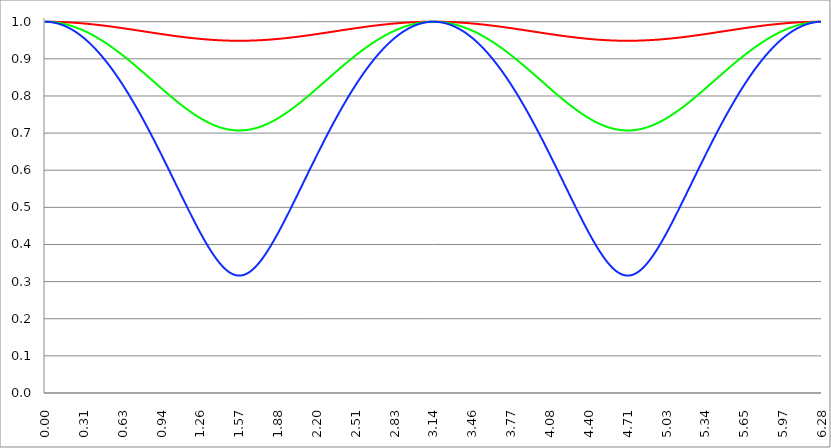
| Category | Series 1 | Series 0 | Series 2 |
|---|---|---|---|
| 0.0 | 1 | 1 | 1 |
| 0.00314159265358979 | 1 | 1 | 1 |
| 0.00628318530717958 | 1 | 1 | 1 |
| 0.00942477796076938 | 1 | 1 | 1 |
| 0.0125663706143592 | 1 | 1 | 1 |
| 0.015707963267949 | 1 | 1 | 1 |
| 0.0188495559215388 | 1 | 1 | 1 |
| 0.0219911485751285 | 1 | 1 | 1 |
| 0.0251327412287183 | 1 | 1 | 1 |
| 0.0282743338823081 | 1 | 1 | 1 |
| 0.0314159265358979 | 1 | 1 | 1 |
| 0.0345575191894877 | 1 | 1 | 0.999 |
| 0.0376991118430775 | 1 | 1 | 0.999 |
| 0.0408407044966673 | 1 | 1 | 0.999 |
| 0.0439822971502571 | 1 | 1 | 0.999 |
| 0.0471238898038469 | 1 | 0.999 | 0.999 |
| 0.0502654824574367 | 1 | 0.999 | 0.999 |
| 0.0534070751110265 | 1 | 0.999 | 0.999 |
| 0.0565486677646163 | 1 | 0.999 | 0.999 |
| 0.059690260418206 | 1 | 0.999 | 0.998 |
| 0.0628318530717958 | 1 | 0.999 | 0.998 |
| 0.0659734457253856 | 1 | 0.999 | 0.998 |
| 0.0691150383789754 | 1 | 0.999 | 0.998 |
| 0.0722566310325652 | 1 | 0.999 | 0.998 |
| 0.075398223686155 | 1 | 0.999 | 0.997 |
| 0.0785398163397448 | 1 | 0.998 | 0.997 |
| 0.0816814089933346 | 1 | 0.998 | 0.997 |
| 0.0848230016469244 | 1 | 0.998 | 0.997 |
| 0.0879645943005142 | 1 | 0.998 | 0.997 |
| 0.091106186954104 | 1 | 0.998 | 0.996 |
| 0.0942477796076937 | 1 | 0.998 | 0.996 |
| 0.0973893722612835 | 1 | 0.998 | 0.996 |
| 0.100530964914873 | 0.999 | 0.997 | 0.995 |
| 0.103672557568463 | 0.999 | 0.997 | 0.995 |
| 0.106814150222053 | 0.999 | 0.997 | 0.995 |
| 0.109955742875643 | 0.999 | 0.997 | 0.995 |
| 0.113097335529233 | 0.999 | 0.997 | 0.994 |
| 0.116238928182822 | 0.999 | 0.997 | 0.994 |
| 0.119380520836412 | 0.999 | 0.996 | 0.994 |
| 0.122522113490002 | 0.999 | 0.996 | 0.993 |
| 0.125663706143592 | 0.999 | 0.996 | 0.993 |
| 0.128805298797181 | 0.999 | 0.996 | 0.993 |
| 0.131946891450771 | 0.999 | 0.996 | 0.992 |
| 0.135088484104361 | 0.999 | 0.995 | 0.992 |
| 0.138230076757951 | 0.999 | 0.995 | 0.991 |
| 0.141371669411541 | 0.999 | 0.995 | 0.991 |
| 0.14451326206513 | 0.999 | 0.995 | 0.991 |
| 0.14765485471872 | 0.999 | 0.995 | 0.99 |
| 0.15079644737231 | 0.999 | 0.994 | 0.99 |
| 0.1539380400259 | 0.999 | 0.994 | 0.989 |
| 0.15707963267949 | 0.999 | 0.994 | 0.989 |
| 0.160221225333079 | 0.999 | 0.994 | 0.988 |
| 0.163362817986669 | 0.999 | 0.993 | 0.988 |
| 0.166504410640259 | 0.999 | 0.993 | 0.988 |
| 0.169646003293849 | 0.999 | 0.993 | 0.987 |
| 0.172787595947439 | 0.999 | 0.993 | 0.987 |
| 0.175929188601028 | 0.998 | 0.992 | 0.986 |
| 0.179070781254618 | 0.998 | 0.992 | 0.986 |
| 0.182212373908208 | 0.998 | 0.992 | 0.985 |
| 0.185353966561798 | 0.998 | 0.991 | 0.985 |
| 0.188495559215388 | 0.998 | 0.991 | 0.984 |
| 0.191637151868977 | 0.998 | 0.991 | 0.984 |
| 0.194778744522567 | 0.998 | 0.991 | 0.983 |
| 0.197920337176157 | 0.998 | 0.99 | 0.982 |
| 0.201061929829747 | 0.998 | 0.99 | 0.982 |
| 0.204203522483336 | 0.998 | 0.99 | 0.981 |
| 0.207345115136926 | 0.998 | 0.989 | 0.981 |
| 0.210486707790516 | 0.998 | 0.989 | 0.98 |
| 0.213628300444106 | 0.998 | 0.989 | 0.98 |
| 0.216769893097696 | 0.998 | 0.988 | 0.979 |
| 0.219911485751285 | 0.998 | 0.988 | 0.978 |
| 0.223053078404875 | 0.998 | 0.988 | 0.978 |
| 0.226194671058465 | 0.997 | 0.987 | 0.977 |
| 0.229336263712055 | 0.997 | 0.987 | 0.976 |
| 0.232477856365645 | 0.997 | 0.987 | 0.976 |
| 0.235619449019234 | 0.997 | 0.986 | 0.975 |
| 0.238761041672824 | 0.997 | 0.986 | 0.975 |
| 0.241902634326414 | 0.997 | 0.986 | 0.974 |
| 0.245044226980004 | 0.997 | 0.985 | 0.973 |
| 0.248185819633594 | 0.997 | 0.985 | 0.972 |
| 0.251327412287183 | 0.997 | 0.984 | 0.972 |
| 0.254469004940773 | 0.997 | 0.984 | 0.971 |
| 0.257610597594363 | 0.997 | 0.984 | 0.97 |
| 0.260752190247953 | 0.997 | 0.983 | 0.97 |
| 0.263893782901543 | 0.997 | 0.983 | 0.969 |
| 0.267035375555132 | 0.997 | 0.982 | 0.968 |
| 0.270176968208722 | 0.996 | 0.982 | 0.967 |
| 0.273318560862312 | 0.996 | 0.982 | 0.967 |
| 0.276460153515902 | 0.996 | 0.981 | 0.966 |
| 0.279601746169492 | 0.996 | 0.981 | 0.965 |
| 0.282743338823082 | 0.996 | 0.98 | 0.964 |
| 0.285884931476671 | 0.996 | 0.98 | 0.964 |
| 0.289026524130261 | 0.996 | 0.979 | 0.963 |
| 0.292168116783851 | 0.996 | 0.979 | 0.962 |
| 0.295309709437441 | 0.996 | 0.979 | 0.961 |
| 0.298451302091031 | 0.996 | 0.978 | 0.96 |
| 0.30159289474462 | 0.996 | 0.978 | 0.959 |
| 0.30473448739821 | 0.995 | 0.977 | 0.959 |
| 0.3078760800518 | 0.995 | 0.977 | 0.958 |
| 0.31101767270539 | 0.995 | 0.976 | 0.957 |
| 0.31415926535898 | 0.995 | 0.976 | 0.956 |
| 0.31730085801257 | 0.995 | 0.975 | 0.955 |
| 0.320442450666159 | 0.995 | 0.975 | 0.954 |
| 0.323584043319749 | 0.995 | 0.974 | 0.953 |
| 0.326725635973339 | 0.995 | 0.974 | 0.953 |
| 0.329867228626929 | 0.995 | 0.973 | 0.952 |
| 0.333008821280519 | 0.995 | 0.973 | 0.951 |
| 0.336150413934108 | 0.995 | 0.972 | 0.95 |
| 0.339292006587698 | 0.994 | 0.972 | 0.949 |
| 0.342433599241288 | 0.994 | 0.971 | 0.948 |
| 0.345575191894878 | 0.994 | 0.971 | 0.947 |
| 0.348716784548468 | 0.994 | 0.97 | 0.946 |
| 0.351858377202058 | 0.994 | 0.97 | 0.945 |
| 0.354999969855647 | 0.994 | 0.969 | 0.944 |
| 0.358141562509237 | 0.994 | 0.969 | 0.943 |
| 0.361283155162827 | 0.994 | 0.968 | 0.942 |
| 0.364424747816417 | 0.994 | 0.968 | 0.941 |
| 0.367566340470007 | 0.994 | 0.967 | 0.94 |
| 0.370707933123597 | 0.993 | 0.967 | 0.939 |
| 0.373849525777186 | 0.993 | 0.966 | 0.938 |
| 0.376991118430776 | 0.993 | 0.966 | 0.937 |
| 0.380132711084366 | 0.993 | 0.965 | 0.936 |
| 0.383274303737956 | 0.993 | 0.964 | 0.935 |
| 0.386415896391546 | 0.993 | 0.964 | 0.934 |
| 0.389557489045135 | 0.993 | 0.963 | 0.933 |
| 0.392699081698725 | 0.993 | 0.963 | 0.932 |
| 0.395840674352315 | 0.993 | 0.962 | 0.931 |
| 0.398982267005905 | 0.992 | 0.962 | 0.93 |
| 0.402123859659495 | 0.992 | 0.961 | 0.929 |
| 0.405265452313085 | 0.992 | 0.96 | 0.927 |
| 0.408407044966674 | 0.992 | 0.96 | 0.926 |
| 0.411548637620264 | 0.992 | 0.959 | 0.925 |
| 0.414690230273854 | 0.992 | 0.959 | 0.924 |
| 0.417831822927444 | 0.992 | 0.958 | 0.923 |
| 0.420973415581034 | 0.992 | 0.957 | 0.922 |
| 0.424115008234623 | 0.991 | 0.957 | 0.921 |
| 0.427256600888213 | 0.991 | 0.956 | 0.919 |
| 0.430398193541803 | 0.991 | 0.955 | 0.918 |
| 0.433539786195393 | 0.991 | 0.955 | 0.917 |
| 0.436681378848983 | 0.991 | 0.954 | 0.916 |
| 0.439822971502573 | 0.991 | 0.954 | 0.915 |
| 0.442964564156162 | 0.991 | 0.953 | 0.914 |
| 0.446106156809752 | 0.991 | 0.952 | 0.912 |
| 0.449247749463342 | 0.991 | 0.952 | 0.911 |
| 0.452389342116932 | 0.99 | 0.951 | 0.91 |
| 0.455530934770522 | 0.99 | 0.95 | 0.909 |
| 0.458672527424111 | 0.99 | 0.95 | 0.908 |
| 0.461814120077701 | 0.99 | 0.949 | 0.906 |
| 0.464955712731291 | 0.99 | 0.948 | 0.905 |
| 0.468097305384881 | 0.99 | 0.948 | 0.904 |
| 0.471238898038471 | 0.99 | 0.947 | 0.902 |
| 0.474380490692061 | 0.99 | 0.946 | 0.901 |
| 0.47752208334565 | 0.989 | 0.946 | 0.9 |
| 0.48066367599924 | 0.989 | 0.945 | 0.899 |
| 0.48380526865283 | 0.989 | 0.944 | 0.897 |
| 0.48694686130642 | 0.989 | 0.944 | 0.896 |
| 0.49008845396001 | 0.989 | 0.943 | 0.895 |
| 0.493230046613599 | 0.989 | 0.942 | 0.893 |
| 0.496371639267189 | 0.989 | 0.942 | 0.892 |
| 0.499513231920779 | 0.988 | 0.941 | 0.891 |
| 0.502654824574369 | 0.988 | 0.94 | 0.889 |
| 0.505796417227959 | 0.988 | 0.939 | 0.888 |
| 0.508938009881549 | 0.988 | 0.939 | 0.887 |
| 0.512079602535138 | 0.988 | 0.938 | 0.885 |
| 0.515221195188728 | 0.988 | 0.937 | 0.884 |
| 0.518362787842318 | 0.988 | 0.937 | 0.883 |
| 0.521504380495908 | 0.988 | 0.936 | 0.881 |
| 0.524645973149498 | 0.987 | 0.935 | 0.88 |
| 0.527787565803087 | 0.987 | 0.934 | 0.878 |
| 0.530929158456677 | 0.987 | 0.934 | 0.877 |
| 0.534070751110267 | 0.987 | 0.933 | 0.876 |
| 0.537212343763857 | 0.987 | 0.932 | 0.874 |
| 0.540353936417447 | 0.987 | 0.931 | 0.873 |
| 0.543495529071037 | 0.987 | 0.931 | 0.871 |
| 0.546637121724626 | 0.986 | 0.93 | 0.87 |
| 0.549778714378216 | 0.986 | 0.929 | 0.869 |
| 0.552920307031806 | 0.986 | 0.928 | 0.867 |
| 0.556061899685396 | 0.986 | 0.928 | 0.866 |
| 0.559203492338986 | 0.986 | 0.927 | 0.864 |
| 0.562345084992576 | 0.986 | 0.926 | 0.863 |
| 0.565486677646165 | 0.986 | 0.925 | 0.861 |
| 0.568628270299755 | 0.985 | 0.925 | 0.86 |
| 0.571769862953345 | 0.985 | 0.924 | 0.858 |
| 0.574911455606935 | 0.985 | 0.923 | 0.857 |
| 0.578053048260525 | 0.985 | 0.922 | 0.855 |
| 0.581194640914114 | 0.985 | 0.922 | 0.854 |
| 0.584336233567704 | 0.985 | 0.921 | 0.852 |
| 0.587477826221294 | 0.985 | 0.92 | 0.851 |
| 0.590619418874884 | 0.984 | 0.919 | 0.849 |
| 0.593761011528474 | 0.984 | 0.918 | 0.848 |
| 0.596902604182064 | 0.984 | 0.918 | 0.846 |
| 0.600044196835653 | 0.984 | 0.917 | 0.844 |
| 0.603185789489243 | 0.984 | 0.916 | 0.843 |
| 0.606327382142833 | 0.984 | 0.915 | 0.841 |
| 0.609468974796423 | 0.983 | 0.914 | 0.84 |
| 0.612610567450013 | 0.983 | 0.914 | 0.838 |
| 0.615752160103602 | 0.983 | 0.913 | 0.837 |
| 0.618893752757192 | 0.983 | 0.912 | 0.835 |
| 0.622035345410782 | 0.983 | 0.911 | 0.833 |
| 0.625176938064372 | 0.983 | 0.91 | 0.832 |
| 0.628318530717962 | 0.983 | 0.91 | 0.83 |
| 0.631460123371551 | 0.982 | 0.909 | 0.828 |
| 0.634601716025141 | 0.982 | 0.908 | 0.827 |
| 0.637743308678731 | 0.982 | 0.907 | 0.825 |
| 0.640884901332321 | 0.982 | 0.906 | 0.824 |
| 0.644026493985911 | 0.982 | 0.905 | 0.822 |
| 0.647168086639501 | 0.982 | 0.905 | 0.82 |
| 0.65030967929309 | 0.982 | 0.904 | 0.819 |
| 0.65345127194668 | 0.981 | 0.903 | 0.817 |
| 0.65659286460027 | 0.981 | 0.902 | 0.815 |
| 0.65973445725386 | 0.981 | 0.901 | 0.814 |
| 0.66287604990745 | 0.981 | 0.9 | 0.812 |
| 0.666017642561039 | 0.981 | 0.9 | 0.81 |
| 0.669159235214629 | 0.981 | 0.899 | 0.809 |
| 0.672300827868219 | 0.98 | 0.898 | 0.807 |
| 0.675442420521809 | 0.98 | 0.897 | 0.805 |
| 0.678584013175399 | 0.98 | 0.896 | 0.803 |
| 0.681725605828989 | 0.98 | 0.895 | 0.802 |
| 0.684867198482578 | 0.98 | 0.894 | 0.8 |
| 0.688008791136168 | 0.98 | 0.894 | 0.798 |
| 0.691150383789758 | 0.979 | 0.893 | 0.796 |
| 0.694291976443348 | 0.979 | 0.892 | 0.795 |
| 0.697433569096938 | 0.979 | 0.891 | 0.793 |
| 0.700575161750528 | 0.979 | 0.89 | 0.791 |
| 0.703716754404117 | 0.979 | 0.889 | 0.789 |
| 0.706858347057707 | 0.979 | 0.888 | 0.788 |
| 0.709999939711297 | 0.979 | 0.887 | 0.786 |
| 0.713141532364887 | 0.978 | 0.887 | 0.784 |
| 0.716283125018477 | 0.978 | 0.886 | 0.782 |
| 0.719424717672066 | 0.978 | 0.885 | 0.781 |
| 0.722566310325656 | 0.978 | 0.884 | 0.779 |
| 0.725707902979246 | 0.978 | 0.883 | 0.777 |
| 0.728849495632836 | 0.978 | 0.882 | 0.775 |
| 0.731991088286426 | 0.977 | 0.881 | 0.773 |
| 0.735132680940016 | 0.977 | 0.88 | 0.771 |
| 0.738274273593605 | 0.977 | 0.88 | 0.77 |
| 0.741415866247195 | 0.977 | 0.879 | 0.768 |
| 0.744557458900785 | 0.977 | 0.878 | 0.766 |
| 0.747699051554375 | 0.977 | 0.877 | 0.764 |
| 0.750840644207965 | 0.976 | 0.876 | 0.762 |
| 0.753982236861554 | 0.976 | 0.875 | 0.76 |
| 0.757123829515144 | 0.976 | 0.874 | 0.759 |
| 0.760265422168734 | 0.976 | 0.873 | 0.757 |
| 0.763407014822324 | 0.976 | 0.872 | 0.755 |
| 0.766548607475914 | 0.976 | 0.871 | 0.753 |
| 0.769690200129504 | 0.975 | 0.871 | 0.751 |
| 0.772831792783093 | 0.975 | 0.87 | 0.749 |
| 0.775973385436683 | 0.975 | 0.869 | 0.747 |
| 0.779114978090273 | 0.975 | 0.868 | 0.745 |
| 0.782256570743863 | 0.975 | 0.867 | 0.744 |
| 0.785398163397453 | 0.975 | 0.866 | 0.742 |
| 0.788539756051042 | 0.975 | 0.865 | 0.74 |
| 0.791681348704632 | 0.974 | 0.864 | 0.738 |
| 0.794822941358222 | 0.974 | 0.863 | 0.736 |
| 0.797964534011812 | 0.974 | 0.862 | 0.734 |
| 0.801106126665402 | 0.974 | 0.861 | 0.732 |
| 0.804247719318992 | 0.974 | 0.861 | 0.73 |
| 0.807389311972581 | 0.974 | 0.86 | 0.728 |
| 0.810530904626171 | 0.973 | 0.859 | 0.726 |
| 0.813672497279761 | 0.973 | 0.858 | 0.724 |
| 0.816814089933351 | 0.973 | 0.857 | 0.722 |
| 0.819955682586941 | 0.973 | 0.856 | 0.72 |
| 0.823097275240531 | 0.973 | 0.855 | 0.718 |
| 0.82623886789412 | 0.973 | 0.854 | 0.716 |
| 0.82938046054771 | 0.972 | 0.853 | 0.714 |
| 0.8325220532013 | 0.972 | 0.852 | 0.712 |
| 0.83566364585489 | 0.972 | 0.851 | 0.711 |
| 0.83880523850848 | 0.972 | 0.85 | 0.709 |
| 0.841946831162069 | 0.972 | 0.85 | 0.707 |
| 0.845088423815659 | 0.972 | 0.849 | 0.705 |
| 0.848230016469249 | 0.971 | 0.848 | 0.703 |
| 0.851371609122839 | 0.971 | 0.847 | 0.701 |
| 0.854513201776429 | 0.971 | 0.846 | 0.699 |
| 0.857654794430019 | 0.971 | 0.845 | 0.697 |
| 0.860796387083608 | 0.971 | 0.844 | 0.695 |
| 0.863937979737198 | 0.971 | 0.843 | 0.693 |
| 0.867079572390788 | 0.97 | 0.842 | 0.691 |
| 0.870221165044378 | 0.97 | 0.841 | 0.688 |
| 0.873362757697968 | 0.97 | 0.84 | 0.686 |
| 0.876504350351557 | 0.97 | 0.839 | 0.684 |
| 0.879645943005147 | 0.97 | 0.839 | 0.682 |
| 0.882787535658737 | 0.97 | 0.838 | 0.68 |
| 0.885929128312327 | 0.97 | 0.837 | 0.678 |
| 0.889070720965917 | 0.969 | 0.836 | 0.676 |
| 0.892212313619507 | 0.969 | 0.835 | 0.674 |
| 0.895353906273096 | 0.969 | 0.834 | 0.672 |
| 0.898495498926686 | 0.969 | 0.833 | 0.67 |
| 0.901637091580276 | 0.969 | 0.832 | 0.668 |
| 0.904778684233866 | 0.969 | 0.831 | 0.666 |
| 0.907920276887456 | 0.968 | 0.83 | 0.664 |
| 0.911061869541045 | 0.968 | 0.829 | 0.662 |
| 0.914203462194635 | 0.968 | 0.828 | 0.66 |
| 0.917345054848225 | 0.968 | 0.828 | 0.658 |
| 0.920486647501815 | 0.968 | 0.827 | 0.656 |
| 0.923628240155405 | 0.968 | 0.826 | 0.654 |
| 0.926769832808995 | 0.967 | 0.825 | 0.652 |
| 0.929911425462584 | 0.967 | 0.824 | 0.649 |
| 0.933053018116174 | 0.967 | 0.823 | 0.647 |
| 0.936194610769764 | 0.967 | 0.822 | 0.645 |
| 0.939336203423354 | 0.967 | 0.821 | 0.643 |
| 0.942477796076944 | 0.967 | 0.82 | 0.641 |
| 0.945619388730533 | 0.967 | 0.819 | 0.639 |
| 0.948760981384123 | 0.966 | 0.818 | 0.637 |
| 0.951902574037713 | 0.966 | 0.817 | 0.635 |
| 0.955044166691303 | 0.966 | 0.817 | 0.633 |
| 0.958185759344893 | 0.966 | 0.816 | 0.631 |
| 0.961327351998483 | 0.966 | 0.815 | 0.628 |
| 0.964468944652072 | 0.966 | 0.814 | 0.626 |
| 0.967610537305662 | 0.965 | 0.813 | 0.624 |
| 0.970752129959252 | 0.965 | 0.812 | 0.622 |
| 0.973893722612842 | 0.965 | 0.811 | 0.62 |
| 0.977035315266432 | 0.965 | 0.81 | 0.618 |
| 0.980176907920022 | 0.965 | 0.809 | 0.616 |
| 0.983318500573611 | 0.965 | 0.808 | 0.614 |
| 0.986460093227201 | 0.965 | 0.808 | 0.611 |
| 0.989601685880791 | 0.964 | 0.807 | 0.609 |
| 0.992743278534381 | 0.964 | 0.806 | 0.607 |
| 0.995884871187971 | 0.964 | 0.805 | 0.605 |
| 0.99902646384156 | 0.964 | 0.804 | 0.603 |
| 1.00216805649515 | 0.964 | 0.803 | 0.601 |
| 1.00530964914874 | 0.964 | 0.802 | 0.599 |
| 1.00845124180233 | 0.964 | 0.801 | 0.597 |
| 1.01159283445592 | 0.963 | 0.8 | 0.594 |
| 1.01473442710951 | 0.963 | 0.8 | 0.592 |
| 1.017876019763099 | 0.963 | 0.799 | 0.59 |
| 1.021017612416689 | 0.963 | 0.798 | 0.588 |
| 1.02415920507028 | 0.963 | 0.797 | 0.586 |
| 1.027300797723869 | 0.963 | 0.796 | 0.584 |
| 1.030442390377459 | 0.963 | 0.795 | 0.582 |
| 1.033583983031048 | 0.962 | 0.794 | 0.579 |
| 1.036725575684638 | 0.962 | 0.793 | 0.577 |
| 1.039867168338228 | 0.962 | 0.793 | 0.575 |
| 1.043008760991818 | 0.962 | 0.792 | 0.573 |
| 1.046150353645408 | 0.962 | 0.791 | 0.571 |
| 1.049291946298998 | 0.962 | 0.79 | 0.569 |
| 1.052433538952587 | 0.962 | 0.789 | 0.567 |
| 1.055575131606177 | 0.961 | 0.788 | 0.564 |
| 1.058716724259767 | 0.961 | 0.787 | 0.562 |
| 1.061858316913357 | 0.961 | 0.787 | 0.56 |
| 1.064999909566947 | 0.961 | 0.786 | 0.558 |
| 1.068141502220536 | 0.961 | 0.785 | 0.556 |
| 1.071283094874126 | 0.961 | 0.784 | 0.554 |
| 1.074424687527716 | 0.961 | 0.783 | 0.551 |
| 1.077566280181306 | 0.96 | 0.782 | 0.549 |
| 1.080707872834896 | 0.96 | 0.782 | 0.547 |
| 1.083849465488486 | 0.96 | 0.781 | 0.545 |
| 1.086991058142075 | 0.96 | 0.78 | 0.543 |
| 1.090132650795665 | 0.96 | 0.779 | 0.541 |
| 1.093274243449255 | 0.96 | 0.778 | 0.539 |
| 1.096415836102845 | 0.96 | 0.777 | 0.536 |
| 1.099557428756435 | 0.959 | 0.777 | 0.534 |
| 1.102699021410025 | 0.959 | 0.776 | 0.532 |
| 1.105840614063614 | 0.959 | 0.775 | 0.53 |
| 1.108982206717204 | 0.959 | 0.774 | 0.528 |
| 1.112123799370794 | 0.959 | 0.773 | 0.526 |
| 1.115265392024384 | 0.959 | 0.773 | 0.524 |
| 1.118406984677974 | 0.959 | 0.772 | 0.522 |
| 1.121548577331563 | 0.959 | 0.771 | 0.519 |
| 1.124690169985153 | 0.958 | 0.77 | 0.517 |
| 1.127831762638743 | 0.958 | 0.769 | 0.515 |
| 1.130973355292333 | 0.958 | 0.769 | 0.513 |
| 1.134114947945923 | 0.958 | 0.768 | 0.511 |
| 1.137256540599513 | 0.958 | 0.767 | 0.509 |
| 1.140398133253102 | 0.958 | 0.766 | 0.507 |
| 1.143539725906692 | 0.958 | 0.765 | 0.505 |
| 1.146681318560282 | 0.958 | 0.765 | 0.502 |
| 1.149822911213872 | 0.957 | 0.764 | 0.5 |
| 1.152964503867462 | 0.957 | 0.763 | 0.498 |
| 1.156106096521051 | 0.957 | 0.762 | 0.496 |
| 1.159247689174641 | 0.957 | 0.762 | 0.494 |
| 1.162389281828231 | 0.957 | 0.761 | 0.492 |
| 1.165530874481821 | 0.957 | 0.76 | 0.49 |
| 1.168672467135411 | 0.957 | 0.759 | 0.488 |
| 1.171814059789001 | 0.957 | 0.759 | 0.486 |
| 1.17495565244259 | 0.956 | 0.758 | 0.484 |
| 1.17809724509618 | 0.956 | 0.757 | 0.481 |
| 1.18123883774977 | 0.956 | 0.756 | 0.479 |
| 1.18438043040336 | 0.956 | 0.756 | 0.477 |
| 1.18752202305695 | 0.956 | 0.755 | 0.475 |
| 1.190663615710539 | 0.956 | 0.754 | 0.473 |
| 1.193805208364129 | 0.956 | 0.753 | 0.471 |
| 1.19694680101772 | 0.956 | 0.753 | 0.469 |
| 1.200088393671309 | 0.956 | 0.752 | 0.467 |
| 1.203229986324899 | 0.955 | 0.751 | 0.465 |
| 1.206371578978489 | 0.955 | 0.751 | 0.463 |
| 1.209513171632078 | 0.955 | 0.75 | 0.461 |
| 1.212654764285668 | 0.955 | 0.749 | 0.459 |
| 1.215796356939258 | 0.955 | 0.749 | 0.457 |
| 1.218937949592848 | 0.955 | 0.748 | 0.455 |
| 1.222079542246438 | 0.955 | 0.747 | 0.453 |
| 1.225221134900027 | 0.955 | 0.747 | 0.451 |
| 1.228362727553617 | 0.955 | 0.746 | 0.449 |
| 1.231504320207207 | 0.955 | 0.745 | 0.447 |
| 1.234645912860797 | 0.954 | 0.745 | 0.445 |
| 1.237787505514387 | 0.954 | 0.744 | 0.443 |
| 1.240929098167977 | 0.954 | 0.743 | 0.441 |
| 1.244070690821566 | 0.954 | 0.743 | 0.439 |
| 1.247212283475156 | 0.954 | 0.742 | 0.437 |
| 1.250353876128746 | 0.954 | 0.741 | 0.435 |
| 1.253495468782336 | 0.954 | 0.741 | 0.433 |
| 1.256637061435926 | 0.954 | 0.74 | 0.431 |
| 1.259778654089515 | 0.954 | 0.739 | 0.429 |
| 1.262920246743105 | 0.954 | 0.739 | 0.427 |
| 1.266061839396695 | 0.953 | 0.738 | 0.425 |
| 1.269203432050285 | 0.953 | 0.738 | 0.424 |
| 1.272345024703875 | 0.953 | 0.737 | 0.422 |
| 1.275486617357465 | 0.953 | 0.736 | 0.42 |
| 1.278628210011054 | 0.953 | 0.736 | 0.418 |
| 1.281769802664644 | 0.953 | 0.735 | 0.416 |
| 1.284911395318234 | 0.953 | 0.735 | 0.414 |
| 1.288052987971824 | 0.953 | 0.734 | 0.412 |
| 1.291194580625414 | 0.953 | 0.734 | 0.411 |
| 1.294336173279003 | 0.953 | 0.733 | 0.409 |
| 1.297477765932593 | 0.953 | 0.732 | 0.407 |
| 1.300619358586183 | 0.952 | 0.732 | 0.405 |
| 1.303760951239773 | 0.952 | 0.731 | 0.403 |
| 1.306902543893363 | 0.952 | 0.731 | 0.402 |
| 1.310044136546953 | 0.952 | 0.73 | 0.4 |
| 1.313185729200542 | 0.952 | 0.73 | 0.398 |
| 1.316327321854132 | 0.952 | 0.729 | 0.396 |
| 1.319468914507722 | 0.952 | 0.729 | 0.395 |
| 1.322610507161312 | 0.952 | 0.728 | 0.393 |
| 1.325752099814902 | 0.952 | 0.728 | 0.391 |
| 1.328893692468491 | 0.952 | 0.727 | 0.389 |
| 1.332035285122081 | 0.952 | 0.727 | 0.388 |
| 1.335176877775671 | 0.952 | 0.726 | 0.386 |
| 1.338318470429261 | 0.951 | 0.726 | 0.384 |
| 1.341460063082851 | 0.951 | 0.725 | 0.383 |
| 1.344601655736441 | 0.951 | 0.725 | 0.381 |
| 1.34774324839003 | 0.951 | 0.724 | 0.38 |
| 1.35088484104362 | 0.951 | 0.724 | 0.378 |
| 1.35402643369721 | 0.951 | 0.723 | 0.376 |
| 1.3571680263508 | 0.951 | 0.723 | 0.375 |
| 1.36030961900439 | 0.951 | 0.722 | 0.373 |
| 1.363451211657979 | 0.951 | 0.722 | 0.372 |
| 1.36659280431157 | 0.951 | 0.721 | 0.37 |
| 1.369734396965159 | 0.951 | 0.721 | 0.369 |
| 1.372875989618749 | 0.951 | 0.721 | 0.367 |
| 1.376017582272339 | 0.951 | 0.72 | 0.366 |
| 1.379159174925929 | 0.951 | 0.72 | 0.364 |
| 1.382300767579518 | 0.951 | 0.719 | 0.363 |
| 1.385442360233108 | 0.95 | 0.719 | 0.361 |
| 1.388583952886698 | 0.95 | 0.719 | 0.36 |
| 1.391725545540288 | 0.95 | 0.718 | 0.359 |
| 1.394867138193878 | 0.95 | 0.718 | 0.357 |
| 1.398008730847468 | 0.95 | 0.717 | 0.356 |
| 1.401150323501057 | 0.95 | 0.717 | 0.354 |
| 1.404291916154647 | 0.95 | 0.717 | 0.353 |
| 1.407433508808237 | 0.95 | 0.716 | 0.352 |
| 1.410575101461827 | 0.95 | 0.716 | 0.351 |
| 1.413716694115417 | 0.95 | 0.716 | 0.349 |
| 1.416858286769006 | 0.95 | 0.715 | 0.348 |
| 1.419999879422596 | 0.95 | 0.715 | 0.347 |
| 1.423141472076186 | 0.95 | 0.715 | 0.346 |
| 1.426283064729776 | 0.95 | 0.714 | 0.344 |
| 1.429424657383366 | 0.95 | 0.714 | 0.343 |
| 1.432566250036956 | 0.95 | 0.714 | 0.342 |
| 1.435707842690545 | 0.95 | 0.713 | 0.341 |
| 1.438849435344135 | 0.95 | 0.713 | 0.34 |
| 1.441991027997725 | 0.95 | 0.713 | 0.339 |
| 1.445132620651315 | 0.95 | 0.713 | 0.338 |
| 1.448274213304905 | 0.949 | 0.712 | 0.337 |
| 1.451415805958494 | 0.949 | 0.712 | 0.336 |
| 1.454557398612084 | 0.949 | 0.712 | 0.335 |
| 1.457698991265674 | 0.949 | 0.712 | 0.334 |
| 1.460840583919264 | 0.949 | 0.711 | 0.333 |
| 1.463982176572854 | 0.949 | 0.711 | 0.332 |
| 1.467123769226444 | 0.949 | 0.711 | 0.331 |
| 1.470265361880033 | 0.949 | 0.711 | 0.33 |
| 1.473406954533623 | 0.949 | 0.71 | 0.329 |
| 1.476548547187213 | 0.949 | 0.71 | 0.329 |
| 1.479690139840803 | 0.949 | 0.71 | 0.328 |
| 1.482831732494393 | 0.949 | 0.71 | 0.327 |
| 1.485973325147982 | 0.949 | 0.71 | 0.326 |
| 1.489114917801572 | 0.949 | 0.709 | 0.326 |
| 1.492256510455162 | 0.949 | 0.709 | 0.325 |
| 1.495398103108752 | 0.949 | 0.709 | 0.324 |
| 1.498539695762342 | 0.949 | 0.709 | 0.324 |
| 1.501681288415932 | 0.949 | 0.709 | 0.323 |
| 1.504822881069521 | 0.949 | 0.709 | 0.322 |
| 1.507964473723111 | 0.949 | 0.708 | 0.322 |
| 1.511106066376701 | 0.949 | 0.708 | 0.321 |
| 1.514247659030291 | 0.949 | 0.708 | 0.321 |
| 1.517389251683881 | 0.949 | 0.708 | 0.32 |
| 1.520530844337471 | 0.949 | 0.708 | 0.32 |
| 1.52367243699106 | 0.949 | 0.708 | 0.319 |
| 1.52681402964465 | 0.949 | 0.708 | 0.319 |
| 1.52995562229824 | 0.949 | 0.708 | 0.319 |
| 1.53309721495183 | 0.949 | 0.708 | 0.318 |
| 1.53623880760542 | 0.949 | 0.708 | 0.318 |
| 1.539380400259009 | 0.949 | 0.707 | 0.318 |
| 1.542521992912599 | 0.949 | 0.707 | 0.317 |
| 1.545663585566189 | 0.949 | 0.707 | 0.317 |
| 1.548805178219779 | 0.949 | 0.707 | 0.317 |
| 1.551946770873369 | 0.949 | 0.707 | 0.317 |
| 1.555088363526959 | 0.949 | 0.707 | 0.317 |
| 1.558229956180548 | 0.949 | 0.707 | 0.316 |
| 1.561371548834138 | 0.949 | 0.707 | 0.316 |
| 1.564513141487728 | 0.949 | 0.707 | 0.316 |
| 1.567654734141318 | 0.949 | 0.707 | 0.316 |
| 1.570796326794908 | 0.949 | 0.707 | 0.316 |
| 1.573937919448497 | 0.949 | 0.707 | 0.316 |
| 1.577079512102087 | 0.949 | 0.707 | 0.316 |
| 1.580221104755677 | 0.949 | 0.707 | 0.316 |
| 1.583362697409267 | 0.949 | 0.707 | 0.316 |
| 1.586504290062857 | 0.949 | 0.707 | 0.317 |
| 1.589645882716447 | 0.949 | 0.707 | 0.317 |
| 1.592787475370036 | 0.949 | 0.707 | 0.317 |
| 1.595929068023626 | 0.949 | 0.707 | 0.317 |
| 1.599070660677216 | 0.949 | 0.707 | 0.317 |
| 1.602212253330806 | 0.949 | 0.707 | 0.318 |
| 1.605353845984396 | 0.949 | 0.708 | 0.318 |
| 1.608495438637985 | 0.949 | 0.708 | 0.318 |
| 1.611637031291575 | 0.949 | 0.708 | 0.319 |
| 1.614778623945165 | 0.949 | 0.708 | 0.319 |
| 1.617920216598755 | 0.949 | 0.708 | 0.319 |
| 1.621061809252345 | 0.949 | 0.708 | 0.32 |
| 1.624203401905935 | 0.949 | 0.708 | 0.32 |
| 1.627344994559524 | 0.949 | 0.708 | 0.321 |
| 1.630486587213114 | 0.949 | 0.708 | 0.321 |
| 1.633628179866704 | 0.949 | 0.708 | 0.322 |
| 1.636769772520294 | 0.949 | 0.709 | 0.322 |
| 1.639911365173884 | 0.949 | 0.709 | 0.323 |
| 1.643052957827473 | 0.949 | 0.709 | 0.324 |
| 1.646194550481063 | 0.949 | 0.709 | 0.324 |
| 1.649336143134653 | 0.949 | 0.709 | 0.325 |
| 1.652477735788243 | 0.949 | 0.709 | 0.326 |
| 1.655619328441833 | 0.949 | 0.71 | 0.326 |
| 1.658760921095423 | 0.949 | 0.71 | 0.327 |
| 1.661902513749012 | 0.949 | 0.71 | 0.328 |
| 1.665044106402602 | 0.949 | 0.71 | 0.329 |
| 1.668185699056192 | 0.949 | 0.71 | 0.329 |
| 1.671327291709782 | 0.949 | 0.711 | 0.33 |
| 1.674468884363372 | 0.949 | 0.711 | 0.331 |
| 1.677610477016961 | 0.949 | 0.711 | 0.332 |
| 1.680752069670551 | 0.949 | 0.711 | 0.333 |
| 1.683893662324141 | 0.949 | 0.712 | 0.334 |
| 1.687035254977731 | 0.949 | 0.712 | 0.335 |
| 1.690176847631321 | 0.949 | 0.712 | 0.336 |
| 1.693318440284911 | 0.949 | 0.712 | 0.337 |
| 1.6964600329385 | 0.95 | 0.713 | 0.338 |
| 1.69960162559209 | 0.95 | 0.713 | 0.339 |
| 1.70274321824568 | 0.95 | 0.713 | 0.34 |
| 1.70588481089927 | 0.95 | 0.713 | 0.341 |
| 1.70902640355286 | 0.95 | 0.714 | 0.342 |
| 1.712167996206449 | 0.95 | 0.714 | 0.343 |
| 1.715309588860039 | 0.95 | 0.714 | 0.344 |
| 1.71845118151363 | 0.95 | 0.715 | 0.346 |
| 1.721592774167219 | 0.95 | 0.715 | 0.347 |
| 1.724734366820809 | 0.95 | 0.715 | 0.348 |
| 1.727875959474399 | 0.95 | 0.716 | 0.349 |
| 1.731017552127988 | 0.95 | 0.716 | 0.351 |
| 1.734159144781578 | 0.95 | 0.716 | 0.352 |
| 1.737300737435168 | 0.95 | 0.717 | 0.353 |
| 1.740442330088758 | 0.95 | 0.717 | 0.354 |
| 1.743583922742348 | 0.95 | 0.717 | 0.356 |
| 1.746725515395937 | 0.95 | 0.718 | 0.357 |
| 1.749867108049527 | 0.95 | 0.718 | 0.359 |
| 1.753008700703117 | 0.95 | 0.719 | 0.36 |
| 1.756150293356707 | 0.95 | 0.719 | 0.361 |
| 1.759291886010297 | 0.951 | 0.719 | 0.363 |
| 1.762433478663887 | 0.951 | 0.72 | 0.364 |
| 1.765575071317476 | 0.951 | 0.72 | 0.366 |
| 1.768716663971066 | 0.951 | 0.721 | 0.367 |
| 1.771858256624656 | 0.951 | 0.721 | 0.369 |
| 1.774999849278246 | 0.951 | 0.721 | 0.37 |
| 1.778141441931836 | 0.951 | 0.722 | 0.372 |
| 1.781283034585426 | 0.951 | 0.722 | 0.373 |
| 1.784424627239015 | 0.951 | 0.723 | 0.375 |
| 1.787566219892605 | 0.951 | 0.723 | 0.376 |
| 1.790707812546195 | 0.951 | 0.724 | 0.378 |
| 1.793849405199785 | 0.951 | 0.724 | 0.38 |
| 1.796990997853375 | 0.951 | 0.725 | 0.381 |
| 1.800132590506964 | 0.951 | 0.725 | 0.383 |
| 1.803274183160554 | 0.951 | 0.726 | 0.384 |
| 1.806415775814144 | 0.952 | 0.726 | 0.386 |
| 1.809557368467734 | 0.952 | 0.727 | 0.388 |
| 1.812698961121324 | 0.952 | 0.727 | 0.389 |
| 1.815840553774914 | 0.952 | 0.728 | 0.391 |
| 1.818982146428503 | 0.952 | 0.728 | 0.393 |
| 1.822123739082093 | 0.952 | 0.729 | 0.395 |
| 1.825265331735683 | 0.952 | 0.729 | 0.396 |
| 1.828406924389273 | 0.952 | 0.73 | 0.398 |
| 1.831548517042863 | 0.952 | 0.73 | 0.4 |
| 1.834690109696452 | 0.952 | 0.731 | 0.402 |
| 1.837831702350042 | 0.952 | 0.731 | 0.403 |
| 1.840973295003632 | 0.952 | 0.732 | 0.405 |
| 1.844114887657222 | 0.953 | 0.732 | 0.407 |
| 1.847256480310812 | 0.953 | 0.733 | 0.409 |
| 1.850398072964402 | 0.953 | 0.734 | 0.411 |
| 1.853539665617991 | 0.953 | 0.734 | 0.412 |
| 1.856681258271581 | 0.953 | 0.735 | 0.414 |
| 1.859822850925171 | 0.953 | 0.735 | 0.416 |
| 1.862964443578761 | 0.953 | 0.736 | 0.418 |
| 1.866106036232351 | 0.953 | 0.736 | 0.42 |
| 1.86924762888594 | 0.953 | 0.737 | 0.422 |
| 1.87238922153953 | 0.953 | 0.738 | 0.424 |
| 1.87553081419312 | 0.953 | 0.738 | 0.425 |
| 1.87867240684671 | 0.954 | 0.739 | 0.427 |
| 1.8818139995003 | 0.954 | 0.739 | 0.429 |
| 1.88495559215389 | 0.954 | 0.74 | 0.431 |
| 1.888097184807479 | 0.954 | 0.741 | 0.433 |
| 1.891238777461069 | 0.954 | 0.741 | 0.435 |
| 1.89438037011466 | 0.954 | 0.742 | 0.437 |
| 1.897521962768249 | 0.954 | 0.743 | 0.439 |
| 1.900663555421839 | 0.954 | 0.743 | 0.441 |
| 1.903805148075429 | 0.954 | 0.744 | 0.443 |
| 1.906946740729018 | 0.954 | 0.745 | 0.445 |
| 1.910088333382608 | 0.955 | 0.745 | 0.447 |
| 1.913229926036198 | 0.955 | 0.746 | 0.449 |
| 1.916371518689788 | 0.955 | 0.747 | 0.451 |
| 1.919513111343378 | 0.955 | 0.747 | 0.453 |
| 1.922654703996967 | 0.955 | 0.748 | 0.455 |
| 1.925796296650557 | 0.955 | 0.749 | 0.457 |
| 1.928937889304147 | 0.955 | 0.749 | 0.459 |
| 1.932079481957737 | 0.955 | 0.75 | 0.461 |
| 1.935221074611327 | 0.955 | 0.751 | 0.463 |
| 1.938362667264917 | 0.955 | 0.751 | 0.465 |
| 1.941504259918506 | 0.956 | 0.752 | 0.467 |
| 1.944645852572096 | 0.956 | 0.753 | 0.469 |
| 1.947787445225686 | 0.956 | 0.753 | 0.471 |
| 1.950929037879276 | 0.956 | 0.754 | 0.473 |
| 1.954070630532866 | 0.956 | 0.755 | 0.475 |
| 1.957212223186455 | 0.956 | 0.756 | 0.477 |
| 1.960353815840045 | 0.956 | 0.756 | 0.479 |
| 1.963495408493635 | 0.956 | 0.757 | 0.481 |
| 1.966637001147225 | 0.956 | 0.758 | 0.484 |
| 1.969778593800815 | 0.957 | 0.759 | 0.486 |
| 1.972920186454405 | 0.957 | 0.759 | 0.488 |
| 1.976061779107994 | 0.957 | 0.76 | 0.49 |
| 1.979203371761584 | 0.957 | 0.761 | 0.492 |
| 1.982344964415174 | 0.957 | 0.762 | 0.494 |
| 1.985486557068764 | 0.957 | 0.762 | 0.496 |
| 1.988628149722354 | 0.957 | 0.763 | 0.498 |
| 1.991769742375943 | 0.957 | 0.764 | 0.5 |
| 1.994911335029533 | 0.958 | 0.765 | 0.502 |
| 1.998052927683123 | 0.958 | 0.765 | 0.505 |
| 2.001194520336712 | 0.958 | 0.766 | 0.507 |
| 2.004336112990302 | 0.958 | 0.767 | 0.509 |
| 2.007477705643892 | 0.958 | 0.768 | 0.511 |
| 2.010619298297482 | 0.958 | 0.769 | 0.513 |
| 2.013760890951071 | 0.958 | 0.769 | 0.515 |
| 2.016902483604661 | 0.958 | 0.77 | 0.517 |
| 2.02004407625825 | 0.959 | 0.771 | 0.519 |
| 2.02318566891184 | 0.959 | 0.772 | 0.522 |
| 2.02632726156543 | 0.959 | 0.773 | 0.524 |
| 2.029468854219019 | 0.959 | 0.773 | 0.526 |
| 2.032610446872609 | 0.959 | 0.774 | 0.528 |
| 2.035752039526198 | 0.959 | 0.775 | 0.53 |
| 2.038893632179788 | 0.959 | 0.776 | 0.532 |
| 2.042035224833378 | 0.959 | 0.777 | 0.534 |
| 2.045176817486967 | 0.96 | 0.777 | 0.536 |
| 2.048318410140557 | 0.96 | 0.778 | 0.539 |
| 2.051460002794146 | 0.96 | 0.779 | 0.541 |
| 2.054601595447736 | 0.96 | 0.78 | 0.543 |
| 2.057743188101325 | 0.96 | 0.781 | 0.545 |
| 2.060884780754915 | 0.96 | 0.782 | 0.547 |
| 2.064026373408505 | 0.96 | 0.782 | 0.549 |
| 2.067167966062094 | 0.961 | 0.783 | 0.551 |
| 2.070309558715684 | 0.961 | 0.784 | 0.554 |
| 2.073451151369273 | 0.961 | 0.785 | 0.556 |
| 2.076592744022863 | 0.961 | 0.786 | 0.558 |
| 2.079734336676452 | 0.961 | 0.787 | 0.56 |
| 2.082875929330042 | 0.961 | 0.787 | 0.562 |
| 2.086017521983632 | 0.961 | 0.788 | 0.564 |
| 2.089159114637221 | 0.962 | 0.789 | 0.567 |
| 2.092300707290811 | 0.962 | 0.79 | 0.569 |
| 2.095442299944401 | 0.962 | 0.791 | 0.571 |
| 2.09858389259799 | 0.962 | 0.792 | 0.573 |
| 2.10172548525158 | 0.962 | 0.793 | 0.575 |
| 2.104867077905169 | 0.962 | 0.793 | 0.577 |
| 2.108008670558759 | 0.962 | 0.794 | 0.579 |
| 2.111150263212349 | 0.963 | 0.795 | 0.582 |
| 2.114291855865938 | 0.963 | 0.796 | 0.584 |
| 2.117433448519528 | 0.963 | 0.797 | 0.586 |
| 2.120575041173117 | 0.963 | 0.798 | 0.588 |
| 2.123716633826707 | 0.963 | 0.799 | 0.59 |
| 2.126858226480297 | 0.963 | 0.8 | 0.592 |
| 2.129999819133886 | 0.963 | 0.8 | 0.594 |
| 2.133141411787476 | 0.964 | 0.801 | 0.597 |
| 2.136283004441065 | 0.964 | 0.802 | 0.599 |
| 2.139424597094655 | 0.964 | 0.803 | 0.601 |
| 2.142566189748245 | 0.964 | 0.804 | 0.603 |
| 2.145707782401834 | 0.964 | 0.805 | 0.605 |
| 2.148849375055424 | 0.964 | 0.806 | 0.607 |
| 2.151990967709013 | 0.964 | 0.807 | 0.609 |
| 2.155132560362603 | 0.965 | 0.808 | 0.611 |
| 2.158274153016193 | 0.965 | 0.808 | 0.614 |
| 2.161415745669782 | 0.965 | 0.809 | 0.616 |
| 2.164557338323372 | 0.965 | 0.81 | 0.618 |
| 2.167698930976961 | 0.965 | 0.811 | 0.62 |
| 2.170840523630551 | 0.965 | 0.812 | 0.622 |
| 2.173982116284141 | 0.965 | 0.813 | 0.624 |
| 2.17712370893773 | 0.966 | 0.814 | 0.626 |
| 2.18026530159132 | 0.966 | 0.815 | 0.628 |
| 2.183406894244909 | 0.966 | 0.816 | 0.631 |
| 2.186548486898499 | 0.966 | 0.817 | 0.633 |
| 2.189690079552089 | 0.966 | 0.817 | 0.635 |
| 2.192831672205678 | 0.966 | 0.818 | 0.637 |
| 2.195973264859268 | 0.967 | 0.819 | 0.639 |
| 2.199114857512857 | 0.967 | 0.82 | 0.641 |
| 2.202256450166447 | 0.967 | 0.821 | 0.643 |
| 2.205398042820036 | 0.967 | 0.822 | 0.645 |
| 2.208539635473626 | 0.967 | 0.823 | 0.647 |
| 2.211681228127216 | 0.967 | 0.824 | 0.649 |
| 2.214822820780805 | 0.967 | 0.825 | 0.652 |
| 2.217964413434395 | 0.968 | 0.826 | 0.654 |
| 2.221106006087984 | 0.968 | 0.827 | 0.656 |
| 2.224247598741574 | 0.968 | 0.828 | 0.658 |
| 2.227389191395164 | 0.968 | 0.828 | 0.66 |
| 2.230530784048753 | 0.968 | 0.829 | 0.662 |
| 2.233672376702343 | 0.968 | 0.83 | 0.664 |
| 2.236813969355933 | 0.969 | 0.831 | 0.666 |
| 2.239955562009522 | 0.969 | 0.832 | 0.668 |
| 2.243097154663112 | 0.969 | 0.833 | 0.67 |
| 2.246238747316701 | 0.969 | 0.834 | 0.672 |
| 2.249380339970291 | 0.969 | 0.835 | 0.674 |
| 2.252521932623881 | 0.969 | 0.836 | 0.676 |
| 2.25566352527747 | 0.97 | 0.837 | 0.678 |
| 2.25880511793106 | 0.97 | 0.838 | 0.68 |
| 2.261946710584649 | 0.97 | 0.839 | 0.682 |
| 2.265088303238239 | 0.97 | 0.839 | 0.684 |
| 2.268229895891829 | 0.97 | 0.84 | 0.686 |
| 2.271371488545418 | 0.97 | 0.841 | 0.688 |
| 2.274513081199008 | 0.97 | 0.842 | 0.691 |
| 2.277654673852597 | 0.971 | 0.843 | 0.693 |
| 2.280796266506186 | 0.971 | 0.844 | 0.695 |
| 2.283937859159776 | 0.971 | 0.845 | 0.697 |
| 2.287079451813366 | 0.971 | 0.846 | 0.699 |
| 2.290221044466955 | 0.971 | 0.847 | 0.701 |
| 2.293362637120545 | 0.971 | 0.848 | 0.703 |
| 2.296504229774135 | 0.972 | 0.849 | 0.705 |
| 2.299645822427724 | 0.972 | 0.85 | 0.707 |
| 2.302787415081314 | 0.972 | 0.85 | 0.709 |
| 2.305929007734904 | 0.972 | 0.851 | 0.711 |
| 2.309070600388493 | 0.972 | 0.852 | 0.712 |
| 2.312212193042083 | 0.972 | 0.853 | 0.714 |
| 2.315353785695672 | 0.973 | 0.854 | 0.716 |
| 2.318495378349262 | 0.973 | 0.855 | 0.718 |
| 2.321636971002852 | 0.973 | 0.856 | 0.72 |
| 2.324778563656441 | 0.973 | 0.857 | 0.722 |
| 2.327920156310031 | 0.973 | 0.858 | 0.724 |
| 2.33106174896362 | 0.973 | 0.859 | 0.726 |
| 2.33420334161721 | 0.974 | 0.86 | 0.728 |
| 2.3373449342708 | 0.974 | 0.861 | 0.73 |
| 2.340486526924389 | 0.974 | 0.861 | 0.732 |
| 2.343628119577979 | 0.974 | 0.862 | 0.734 |
| 2.346769712231568 | 0.974 | 0.863 | 0.736 |
| 2.349911304885158 | 0.974 | 0.864 | 0.738 |
| 2.353052897538748 | 0.975 | 0.865 | 0.74 |
| 2.356194490192337 | 0.975 | 0.866 | 0.742 |
| 2.359336082845927 | 0.975 | 0.867 | 0.744 |
| 2.362477675499516 | 0.975 | 0.868 | 0.745 |
| 2.365619268153106 | 0.975 | 0.869 | 0.747 |
| 2.368760860806696 | 0.975 | 0.87 | 0.749 |
| 2.371902453460285 | 0.975 | 0.871 | 0.751 |
| 2.375044046113875 | 0.976 | 0.871 | 0.753 |
| 2.378185638767464 | 0.976 | 0.872 | 0.755 |
| 2.381327231421054 | 0.976 | 0.873 | 0.757 |
| 2.384468824074644 | 0.976 | 0.874 | 0.759 |
| 2.387610416728233 | 0.976 | 0.875 | 0.76 |
| 2.390752009381823 | 0.976 | 0.876 | 0.762 |
| 2.393893602035412 | 0.977 | 0.877 | 0.764 |
| 2.397035194689002 | 0.977 | 0.878 | 0.766 |
| 2.400176787342591 | 0.977 | 0.879 | 0.768 |
| 2.403318379996181 | 0.977 | 0.88 | 0.77 |
| 2.406459972649771 | 0.977 | 0.88 | 0.771 |
| 2.40960156530336 | 0.977 | 0.881 | 0.773 |
| 2.41274315795695 | 0.978 | 0.882 | 0.775 |
| 2.41588475061054 | 0.978 | 0.883 | 0.777 |
| 2.419026343264129 | 0.978 | 0.884 | 0.779 |
| 2.422167935917719 | 0.978 | 0.885 | 0.781 |
| 2.425309528571308 | 0.978 | 0.886 | 0.782 |
| 2.428451121224898 | 0.978 | 0.887 | 0.784 |
| 2.431592713878488 | 0.979 | 0.887 | 0.786 |
| 2.434734306532077 | 0.979 | 0.888 | 0.788 |
| 2.437875899185667 | 0.979 | 0.889 | 0.789 |
| 2.441017491839256 | 0.979 | 0.89 | 0.791 |
| 2.444159084492846 | 0.979 | 0.891 | 0.793 |
| 2.447300677146435 | 0.979 | 0.892 | 0.795 |
| 2.450442269800025 | 0.979 | 0.893 | 0.796 |
| 2.453583862453615 | 0.98 | 0.894 | 0.798 |
| 2.456725455107204 | 0.98 | 0.894 | 0.8 |
| 2.459867047760794 | 0.98 | 0.895 | 0.802 |
| 2.463008640414384 | 0.98 | 0.896 | 0.803 |
| 2.466150233067973 | 0.98 | 0.897 | 0.805 |
| 2.469291825721563 | 0.98 | 0.898 | 0.807 |
| 2.472433418375152 | 0.981 | 0.899 | 0.809 |
| 2.475575011028742 | 0.981 | 0.9 | 0.81 |
| 2.478716603682332 | 0.981 | 0.9 | 0.812 |
| 2.481858196335921 | 0.981 | 0.901 | 0.814 |
| 2.48499978898951 | 0.981 | 0.902 | 0.815 |
| 2.4881413816431 | 0.981 | 0.903 | 0.817 |
| 2.49128297429669 | 0.982 | 0.904 | 0.819 |
| 2.49442456695028 | 0.982 | 0.905 | 0.82 |
| 2.497566159603869 | 0.982 | 0.905 | 0.822 |
| 2.500707752257458 | 0.982 | 0.906 | 0.824 |
| 2.503849344911048 | 0.982 | 0.907 | 0.825 |
| 2.506990937564638 | 0.982 | 0.908 | 0.827 |
| 2.510132530218228 | 0.982 | 0.909 | 0.828 |
| 2.513274122871817 | 0.983 | 0.91 | 0.83 |
| 2.516415715525407 | 0.983 | 0.91 | 0.832 |
| 2.519557308178996 | 0.983 | 0.911 | 0.833 |
| 2.522698900832586 | 0.983 | 0.912 | 0.835 |
| 2.525840493486176 | 0.983 | 0.913 | 0.837 |
| 2.528982086139765 | 0.983 | 0.914 | 0.838 |
| 2.532123678793355 | 0.983 | 0.914 | 0.84 |
| 2.535265271446944 | 0.984 | 0.915 | 0.841 |
| 2.538406864100534 | 0.984 | 0.916 | 0.843 |
| 2.541548456754124 | 0.984 | 0.917 | 0.844 |
| 2.544690049407713 | 0.984 | 0.918 | 0.846 |
| 2.547831642061302 | 0.984 | 0.918 | 0.848 |
| 2.550973234714892 | 0.984 | 0.919 | 0.849 |
| 2.554114827368482 | 0.985 | 0.92 | 0.851 |
| 2.557256420022072 | 0.985 | 0.921 | 0.852 |
| 2.560398012675661 | 0.985 | 0.922 | 0.854 |
| 2.563539605329251 | 0.985 | 0.922 | 0.855 |
| 2.56668119798284 | 0.985 | 0.923 | 0.857 |
| 2.56982279063643 | 0.985 | 0.924 | 0.858 |
| 2.57296438329002 | 0.985 | 0.925 | 0.86 |
| 2.576105975943609 | 0.986 | 0.925 | 0.861 |
| 2.579247568597199 | 0.986 | 0.926 | 0.863 |
| 2.582389161250788 | 0.986 | 0.927 | 0.864 |
| 2.585530753904377 | 0.986 | 0.928 | 0.866 |
| 2.588672346557967 | 0.986 | 0.928 | 0.867 |
| 2.591813939211557 | 0.986 | 0.929 | 0.869 |
| 2.594955531865147 | 0.986 | 0.93 | 0.87 |
| 2.598097124518736 | 0.987 | 0.931 | 0.871 |
| 2.601238717172326 | 0.987 | 0.931 | 0.873 |
| 2.604380309825915 | 0.987 | 0.932 | 0.874 |
| 2.607521902479505 | 0.987 | 0.933 | 0.876 |
| 2.610663495133095 | 0.987 | 0.934 | 0.877 |
| 2.613805087786684 | 0.987 | 0.934 | 0.878 |
| 2.616946680440274 | 0.987 | 0.935 | 0.88 |
| 2.620088273093863 | 0.988 | 0.936 | 0.881 |
| 2.623229865747452 | 0.988 | 0.937 | 0.883 |
| 2.626371458401042 | 0.988 | 0.937 | 0.884 |
| 2.629513051054632 | 0.988 | 0.938 | 0.885 |
| 2.632654643708222 | 0.988 | 0.939 | 0.887 |
| 2.635796236361811 | 0.988 | 0.939 | 0.888 |
| 2.638937829015401 | 0.988 | 0.94 | 0.889 |
| 2.642079421668991 | 0.988 | 0.941 | 0.891 |
| 2.64522101432258 | 0.989 | 0.942 | 0.892 |
| 2.64836260697617 | 0.989 | 0.942 | 0.893 |
| 2.651504199629759 | 0.989 | 0.943 | 0.895 |
| 2.654645792283349 | 0.989 | 0.944 | 0.896 |
| 2.657787384936938 | 0.989 | 0.944 | 0.897 |
| 2.660928977590528 | 0.989 | 0.945 | 0.899 |
| 2.664070570244118 | 0.989 | 0.946 | 0.9 |
| 2.667212162897707 | 0.99 | 0.946 | 0.901 |
| 2.670353755551297 | 0.99 | 0.947 | 0.902 |
| 2.673495348204887 | 0.99 | 0.948 | 0.904 |
| 2.676636940858476 | 0.99 | 0.948 | 0.905 |
| 2.679778533512066 | 0.99 | 0.949 | 0.906 |
| 2.682920126165655 | 0.99 | 0.95 | 0.908 |
| 2.686061718819245 | 0.99 | 0.95 | 0.909 |
| 2.689203311472835 | 0.99 | 0.951 | 0.91 |
| 2.692344904126424 | 0.991 | 0.952 | 0.911 |
| 2.695486496780014 | 0.991 | 0.952 | 0.912 |
| 2.698628089433603 | 0.991 | 0.953 | 0.914 |
| 2.701769682087193 | 0.991 | 0.954 | 0.915 |
| 2.704911274740782 | 0.991 | 0.954 | 0.916 |
| 2.708052867394372 | 0.991 | 0.955 | 0.917 |
| 2.711194460047962 | 0.991 | 0.955 | 0.918 |
| 2.714336052701551 | 0.991 | 0.956 | 0.919 |
| 2.717477645355141 | 0.991 | 0.957 | 0.921 |
| 2.720619238008731 | 0.992 | 0.957 | 0.922 |
| 2.72376083066232 | 0.992 | 0.958 | 0.923 |
| 2.72690242331591 | 0.992 | 0.959 | 0.924 |
| 2.730044015969499 | 0.992 | 0.959 | 0.925 |
| 2.733185608623089 | 0.992 | 0.96 | 0.926 |
| 2.736327201276678 | 0.992 | 0.96 | 0.927 |
| 2.739468793930268 | 0.992 | 0.961 | 0.929 |
| 2.742610386583858 | 0.992 | 0.962 | 0.93 |
| 2.745751979237447 | 0.993 | 0.962 | 0.931 |
| 2.748893571891036 | 0.993 | 0.963 | 0.932 |
| 2.752035164544627 | 0.993 | 0.963 | 0.933 |
| 2.755176757198216 | 0.993 | 0.964 | 0.934 |
| 2.758318349851806 | 0.993 | 0.964 | 0.935 |
| 2.761459942505395 | 0.993 | 0.965 | 0.936 |
| 2.764601535158985 | 0.993 | 0.966 | 0.937 |
| 2.767743127812574 | 0.993 | 0.966 | 0.938 |
| 2.770884720466164 | 0.993 | 0.967 | 0.939 |
| 2.774026313119754 | 0.994 | 0.967 | 0.94 |
| 2.777167905773343 | 0.994 | 0.968 | 0.941 |
| 2.780309498426932 | 0.994 | 0.968 | 0.942 |
| 2.783451091080522 | 0.994 | 0.969 | 0.943 |
| 2.786592683734112 | 0.994 | 0.969 | 0.944 |
| 2.789734276387701 | 0.994 | 0.97 | 0.945 |
| 2.792875869041291 | 0.994 | 0.97 | 0.946 |
| 2.796017461694881 | 0.994 | 0.971 | 0.947 |
| 2.79915905434847 | 0.994 | 0.971 | 0.948 |
| 2.80230064700206 | 0.994 | 0.972 | 0.949 |
| 2.80544223965565 | 0.995 | 0.972 | 0.95 |
| 2.808583832309239 | 0.995 | 0.973 | 0.951 |
| 2.811725424962829 | 0.995 | 0.973 | 0.952 |
| 2.814867017616419 | 0.995 | 0.974 | 0.953 |
| 2.818008610270008 | 0.995 | 0.974 | 0.953 |
| 2.821150202923598 | 0.995 | 0.975 | 0.954 |
| 2.824291795577187 | 0.995 | 0.975 | 0.955 |
| 2.827433388230777 | 0.995 | 0.976 | 0.956 |
| 2.830574980884366 | 0.995 | 0.976 | 0.957 |
| 2.833716573537956 | 0.995 | 0.977 | 0.958 |
| 2.836858166191546 | 0.995 | 0.977 | 0.959 |
| 2.839999758845135 | 0.996 | 0.978 | 0.959 |
| 2.843141351498725 | 0.996 | 0.978 | 0.96 |
| 2.846282944152314 | 0.996 | 0.979 | 0.961 |
| 2.849424536805904 | 0.996 | 0.979 | 0.962 |
| 2.852566129459494 | 0.996 | 0.979 | 0.963 |
| 2.855707722113083 | 0.996 | 0.98 | 0.964 |
| 2.858849314766673 | 0.996 | 0.98 | 0.964 |
| 2.861990907420262 | 0.996 | 0.981 | 0.965 |
| 2.865132500073852 | 0.996 | 0.981 | 0.966 |
| 2.868274092727442 | 0.996 | 0.982 | 0.967 |
| 2.871415685381031 | 0.996 | 0.982 | 0.967 |
| 2.874557278034621 | 0.997 | 0.982 | 0.968 |
| 2.87769887068821 | 0.997 | 0.983 | 0.969 |
| 2.8808404633418 | 0.997 | 0.983 | 0.97 |
| 2.88398205599539 | 0.997 | 0.984 | 0.97 |
| 2.88712364864898 | 0.997 | 0.984 | 0.971 |
| 2.890265241302569 | 0.997 | 0.984 | 0.972 |
| 2.893406833956158 | 0.997 | 0.985 | 0.972 |
| 2.896548426609748 | 0.997 | 0.985 | 0.973 |
| 2.899690019263338 | 0.997 | 0.986 | 0.974 |
| 2.902831611916927 | 0.997 | 0.986 | 0.975 |
| 2.905973204570517 | 0.997 | 0.986 | 0.975 |
| 2.909114797224106 | 0.997 | 0.987 | 0.976 |
| 2.912256389877696 | 0.997 | 0.987 | 0.976 |
| 2.915397982531286 | 0.997 | 0.987 | 0.977 |
| 2.918539575184875 | 0.998 | 0.988 | 0.978 |
| 2.921681167838465 | 0.998 | 0.988 | 0.978 |
| 2.924822760492054 | 0.998 | 0.988 | 0.979 |
| 2.927964353145644 | 0.998 | 0.989 | 0.98 |
| 2.931105945799234 | 0.998 | 0.989 | 0.98 |
| 2.934247538452823 | 0.998 | 0.989 | 0.981 |
| 2.937389131106413 | 0.998 | 0.99 | 0.981 |
| 2.940530723760002 | 0.998 | 0.99 | 0.982 |
| 2.943672316413592 | 0.998 | 0.99 | 0.982 |
| 2.946813909067182 | 0.998 | 0.991 | 0.983 |
| 2.949955501720771 | 0.998 | 0.991 | 0.984 |
| 2.953097094374361 | 0.998 | 0.991 | 0.984 |
| 2.95623868702795 | 0.998 | 0.991 | 0.985 |
| 2.95938027968154 | 0.998 | 0.992 | 0.985 |
| 2.96252187233513 | 0.998 | 0.992 | 0.986 |
| 2.965663464988719 | 0.998 | 0.992 | 0.986 |
| 2.968805057642309 | 0.999 | 0.993 | 0.987 |
| 2.971946650295898 | 0.999 | 0.993 | 0.987 |
| 2.975088242949488 | 0.999 | 0.993 | 0.988 |
| 2.978229835603078 | 0.999 | 0.993 | 0.988 |
| 2.981371428256667 | 0.999 | 0.994 | 0.988 |
| 2.984513020910257 | 0.999 | 0.994 | 0.989 |
| 2.987654613563846 | 0.999 | 0.994 | 0.989 |
| 2.990796206217436 | 0.999 | 0.994 | 0.99 |
| 2.993937798871025 | 0.999 | 0.995 | 0.99 |
| 2.997079391524615 | 0.999 | 0.995 | 0.991 |
| 3.000220984178205 | 0.999 | 0.995 | 0.991 |
| 3.003362576831794 | 0.999 | 0.995 | 0.991 |
| 3.006504169485384 | 0.999 | 0.995 | 0.992 |
| 3.009645762138974 | 0.999 | 0.996 | 0.992 |
| 3.012787354792563 | 0.999 | 0.996 | 0.993 |
| 3.015928947446153 | 0.999 | 0.996 | 0.993 |
| 3.019070540099742 | 0.999 | 0.996 | 0.993 |
| 3.022212132753332 | 0.999 | 0.996 | 0.994 |
| 3.025353725406922 | 0.999 | 0.997 | 0.994 |
| 3.028495318060511 | 0.999 | 0.997 | 0.994 |
| 3.031636910714101 | 0.999 | 0.997 | 0.995 |
| 3.03477850336769 | 0.999 | 0.997 | 0.995 |
| 3.03792009602128 | 0.999 | 0.997 | 0.995 |
| 3.04106168867487 | 0.999 | 0.997 | 0.995 |
| 3.04420328132846 | 1 | 0.998 | 0.996 |
| 3.047344873982049 | 1 | 0.998 | 0.996 |
| 3.050486466635638 | 1 | 0.998 | 0.996 |
| 3.053628059289228 | 1 | 0.998 | 0.997 |
| 3.056769651942818 | 1 | 0.998 | 0.997 |
| 3.059911244596407 | 1 | 0.998 | 0.997 |
| 3.063052837249997 | 1 | 0.998 | 0.997 |
| 3.066194429903586 | 1 | 0.999 | 0.997 |
| 3.069336022557176 | 1 | 0.999 | 0.998 |
| 3.072477615210766 | 1 | 0.999 | 0.998 |
| 3.075619207864355 | 1 | 0.999 | 0.998 |
| 3.078760800517945 | 1 | 0.999 | 0.998 |
| 3.081902393171534 | 1 | 0.999 | 0.998 |
| 3.085043985825124 | 1 | 0.999 | 0.999 |
| 3.088185578478713 | 1 | 0.999 | 0.999 |
| 3.091327171132303 | 1 | 0.999 | 0.999 |
| 3.094468763785893 | 1 | 0.999 | 0.999 |
| 3.097610356439482 | 1 | 1 | 0.999 |
| 3.100751949093072 | 1 | 1 | 0.999 |
| 3.103893541746661 | 1 | 1 | 0.999 |
| 3.107035134400251 | 1 | 1 | 0.999 |
| 3.110176727053841 | 1 | 1 | 1 |
| 3.11331831970743 | 1 | 1 | 1 |
| 3.11645991236102 | 1 | 1 | 1 |
| 3.11960150501461 | 1 | 1 | 1 |
| 3.122743097668199 | 1 | 1 | 1 |
| 3.125884690321789 | 1 | 1 | 1 |
| 3.129026282975378 | 1 | 1 | 1 |
| 3.132167875628968 | 1 | 1 | 1 |
| 3.135309468282557 | 1 | 1 | 1 |
| 3.138451060936147 | 1 | 1 | 1 |
| 3.141592653589737 | 1 | 1 | 1 |
| 3.144734246243326 | 1 | 1 | 1 |
| 3.147875838896916 | 1 | 1 | 1 |
| 3.151017431550505 | 1 | 1 | 1 |
| 3.154159024204095 | 1 | 1 | 1 |
| 3.157300616857685 | 1 | 1 | 1 |
| 3.160442209511274 | 1 | 1 | 1 |
| 3.163583802164864 | 1 | 1 | 1 |
| 3.166725394818453 | 1 | 1 | 1 |
| 3.169866987472043 | 1 | 1 | 1 |
| 3.173008580125633 | 1 | 1 | 1 |
| 3.176150172779222 | 1 | 1 | 0.999 |
| 3.179291765432812 | 1 | 1 | 0.999 |
| 3.182433358086401 | 1 | 1 | 0.999 |
| 3.185574950739991 | 1 | 1 | 0.999 |
| 3.188716543393581 | 1 | 0.999 | 0.999 |
| 3.19185813604717 | 1 | 0.999 | 0.999 |
| 3.19499972870076 | 1 | 0.999 | 0.999 |
| 3.198141321354349 | 1 | 0.999 | 0.999 |
| 3.20128291400794 | 1 | 0.999 | 0.998 |
| 3.204424506661528 | 1 | 0.999 | 0.998 |
| 3.207566099315118 | 1 | 0.999 | 0.998 |
| 3.210707691968708 | 1 | 0.999 | 0.998 |
| 3.213849284622297 | 1 | 0.999 | 0.998 |
| 3.216990877275887 | 1 | 0.999 | 0.997 |
| 3.220132469929476 | 1 | 0.998 | 0.997 |
| 3.223274062583066 | 1 | 0.998 | 0.997 |
| 3.226415655236656 | 1 | 0.998 | 0.997 |
| 3.229557247890245 | 1 | 0.998 | 0.997 |
| 3.232698840543835 | 1 | 0.998 | 0.996 |
| 3.235840433197425 | 1 | 0.998 | 0.996 |
| 3.238982025851014 | 1 | 0.998 | 0.996 |
| 3.242123618504604 | 0.999 | 0.997 | 0.995 |
| 3.245265211158193 | 0.999 | 0.997 | 0.995 |
| 3.248406803811783 | 0.999 | 0.997 | 0.995 |
| 3.251548396465373 | 0.999 | 0.997 | 0.995 |
| 3.254689989118962 | 0.999 | 0.997 | 0.994 |
| 3.257831581772551 | 0.999 | 0.997 | 0.994 |
| 3.260973174426141 | 0.999 | 0.996 | 0.994 |
| 3.26411476707973 | 0.999 | 0.996 | 0.993 |
| 3.267256359733321 | 0.999 | 0.996 | 0.993 |
| 3.27039795238691 | 0.999 | 0.996 | 0.993 |
| 3.2735395450405 | 0.999 | 0.996 | 0.992 |
| 3.276681137694089 | 0.999 | 0.995 | 0.992 |
| 3.279822730347679 | 0.999 | 0.995 | 0.991 |
| 3.282964323001269 | 0.999 | 0.995 | 0.991 |
| 3.286105915654858 | 0.999 | 0.995 | 0.991 |
| 3.289247508308448 | 0.999 | 0.995 | 0.99 |
| 3.292389100962037 | 0.999 | 0.994 | 0.99 |
| 3.295530693615627 | 0.999 | 0.994 | 0.989 |
| 3.298672286269217 | 0.999 | 0.994 | 0.989 |
| 3.301813878922806 | 0.999 | 0.994 | 0.988 |
| 3.304955471576396 | 0.999 | 0.993 | 0.988 |
| 3.308097064229985 | 0.999 | 0.993 | 0.988 |
| 3.311238656883575 | 0.999 | 0.993 | 0.987 |
| 3.314380249537165 | 0.999 | 0.993 | 0.987 |
| 3.317521842190754 | 0.998 | 0.992 | 0.986 |
| 3.320663434844344 | 0.998 | 0.992 | 0.986 |
| 3.323805027497933 | 0.998 | 0.992 | 0.985 |
| 3.326946620151523 | 0.998 | 0.991 | 0.985 |
| 3.330088212805113 | 0.998 | 0.991 | 0.984 |
| 3.333229805458702 | 0.998 | 0.991 | 0.984 |
| 3.336371398112292 | 0.998 | 0.991 | 0.983 |
| 3.339512990765881 | 0.998 | 0.99 | 0.982 |
| 3.342654583419471 | 0.998 | 0.99 | 0.982 |
| 3.345796176073061 | 0.998 | 0.99 | 0.981 |
| 3.34893776872665 | 0.998 | 0.989 | 0.981 |
| 3.35207936138024 | 0.998 | 0.989 | 0.98 |
| 3.355220954033829 | 0.998 | 0.989 | 0.98 |
| 3.358362546687419 | 0.998 | 0.988 | 0.979 |
| 3.361504139341009 | 0.998 | 0.988 | 0.978 |
| 3.364645731994598 | 0.998 | 0.988 | 0.978 |
| 3.367787324648188 | 0.997 | 0.987 | 0.977 |
| 3.370928917301777 | 0.997 | 0.987 | 0.976 |
| 3.374070509955367 | 0.997 | 0.987 | 0.976 |
| 3.377212102608956 | 0.997 | 0.986 | 0.975 |
| 3.380353695262546 | 0.997 | 0.986 | 0.975 |
| 3.383495287916136 | 0.997 | 0.986 | 0.974 |
| 3.386636880569725 | 0.997 | 0.985 | 0.973 |
| 3.389778473223315 | 0.997 | 0.985 | 0.972 |
| 3.392920065876904 | 0.997 | 0.984 | 0.972 |
| 3.396061658530494 | 0.997 | 0.984 | 0.971 |
| 3.399203251184084 | 0.997 | 0.984 | 0.97 |
| 3.402344843837673 | 0.997 | 0.983 | 0.97 |
| 3.405486436491263 | 0.997 | 0.983 | 0.969 |
| 3.408628029144852 | 0.997 | 0.982 | 0.968 |
| 3.411769621798442 | 0.996 | 0.982 | 0.967 |
| 3.414911214452032 | 0.996 | 0.982 | 0.967 |
| 3.418052807105621 | 0.996 | 0.981 | 0.966 |
| 3.421194399759211 | 0.996 | 0.981 | 0.965 |
| 3.4243359924128 | 0.996 | 0.98 | 0.964 |
| 3.42747758506639 | 0.996 | 0.98 | 0.964 |
| 3.43061917771998 | 0.996 | 0.979 | 0.963 |
| 3.433760770373569 | 0.996 | 0.979 | 0.962 |
| 3.436902363027159 | 0.996 | 0.979 | 0.961 |
| 3.440043955680748 | 0.996 | 0.978 | 0.96 |
| 3.443185548334338 | 0.996 | 0.978 | 0.959 |
| 3.446327140987927 | 0.995 | 0.977 | 0.959 |
| 3.449468733641517 | 0.995 | 0.977 | 0.958 |
| 3.452610326295107 | 0.995 | 0.976 | 0.957 |
| 3.455751918948696 | 0.995 | 0.976 | 0.956 |
| 3.458893511602286 | 0.995 | 0.975 | 0.955 |
| 3.462035104255876 | 0.995 | 0.975 | 0.954 |
| 3.465176696909465 | 0.995 | 0.974 | 0.953 |
| 3.468318289563055 | 0.995 | 0.974 | 0.953 |
| 3.471459882216644 | 0.995 | 0.973 | 0.952 |
| 3.474601474870234 | 0.995 | 0.973 | 0.951 |
| 3.477743067523824 | 0.995 | 0.972 | 0.95 |
| 3.480884660177413 | 0.994 | 0.972 | 0.949 |
| 3.484026252831002 | 0.994 | 0.971 | 0.948 |
| 3.487167845484592 | 0.994 | 0.971 | 0.947 |
| 3.490309438138182 | 0.994 | 0.97 | 0.946 |
| 3.493451030791772 | 0.994 | 0.97 | 0.945 |
| 3.496592623445361 | 0.994 | 0.969 | 0.944 |
| 3.499734216098951 | 0.994 | 0.969 | 0.943 |
| 3.50287580875254 | 0.994 | 0.968 | 0.942 |
| 3.50601740140613 | 0.994 | 0.968 | 0.941 |
| 3.50915899405972 | 0.994 | 0.967 | 0.94 |
| 3.512300586713309 | 0.993 | 0.967 | 0.939 |
| 3.515442179366899 | 0.993 | 0.966 | 0.938 |
| 3.518583772020488 | 0.993 | 0.966 | 0.937 |
| 3.521725364674078 | 0.993 | 0.965 | 0.936 |
| 3.524866957327668 | 0.993 | 0.964 | 0.935 |
| 3.528008549981257 | 0.993 | 0.964 | 0.934 |
| 3.531150142634847 | 0.993 | 0.963 | 0.933 |
| 3.534291735288436 | 0.993 | 0.963 | 0.932 |
| 3.537433327942026 | 0.993 | 0.962 | 0.931 |
| 3.540574920595616 | 0.992 | 0.962 | 0.93 |
| 3.543716513249205 | 0.992 | 0.961 | 0.929 |
| 3.546858105902795 | 0.992 | 0.96 | 0.927 |
| 3.549999698556384 | 0.992 | 0.96 | 0.926 |
| 3.553141291209974 | 0.992 | 0.959 | 0.925 |
| 3.556282883863564 | 0.992 | 0.959 | 0.924 |
| 3.559424476517153 | 0.992 | 0.958 | 0.923 |
| 3.562566069170743 | 0.992 | 0.957 | 0.922 |
| 3.565707661824332 | 0.991 | 0.957 | 0.921 |
| 3.568849254477922 | 0.991 | 0.956 | 0.919 |
| 3.571990847131511 | 0.991 | 0.955 | 0.918 |
| 3.575132439785101 | 0.991 | 0.955 | 0.917 |
| 3.578274032438691 | 0.991 | 0.954 | 0.916 |
| 3.58141562509228 | 0.991 | 0.954 | 0.915 |
| 3.58455721774587 | 0.991 | 0.953 | 0.914 |
| 3.58769881039946 | 0.991 | 0.952 | 0.912 |
| 3.590840403053049 | 0.991 | 0.952 | 0.911 |
| 3.593981995706639 | 0.99 | 0.951 | 0.91 |
| 3.597123588360228 | 0.99 | 0.95 | 0.909 |
| 3.600265181013818 | 0.99 | 0.95 | 0.908 |
| 3.603406773667407 | 0.99 | 0.949 | 0.906 |
| 3.606548366320997 | 0.99 | 0.948 | 0.905 |
| 3.609689958974587 | 0.99 | 0.948 | 0.904 |
| 3.612831551628176 | 0.99 | 0.947 | 0.902 |
| 3.615973144281766 | 0.99 | 0.946 | 0.901 |
| 3.619114736935355 | 0.989 | 0.946 | 0.9 |
| 3.622256329588945 | 0.989 | 0.945 | 0.899 |
| 3.625397922242534 | 0.989 | 0.944 | 0.897 |
| 3.628539514896124 | 0.989 | 0.944 | 0.896 |
| 3.631681107549714 | 0.989 | 0.943 | 0.895 |
| 3.634822700203303 | 0.989 | 0.942 | 0.893 |
| 3.637964292856893 | 0.989 | 0.942 | 0.892 |
| 3.641105885510483 | 0.988 | 0.941 | 0.891 |
| 3.644247478164072 | 0.988 | 0.94 | 0.889 |
| 3.647389070817662 | 0.988 | 0.939 | 0.888 |
| 3.650530663471251 | 0.988 | 0.939 | 0.887 |
| 3.653672256124841 | 0.988 | 0.938 | 0.885 |
| 3.656813848778431 | 0.988 | 0.937 | 0.884 |
| 3.65995544143202 | 0.988 | 0.937 | 0.883 |
| 3.66309703408561 | 0.988 | 0.936 | 0.881 |
| 3.666238626739199 | 0.987 | 0.935 | 0.88 |
| 3.66938021939279 | 0.987 | 0.934 | 0.878 |
| 3.672521812046378 | 0.987 | 0.934 | 0.877 |
| 3.675663404699968 | 0.987 | 0.933 | 0.876 |
| 3.678804997353558 | 0.987 | 0.932 | 0.874 |
| 3.681946590007147 | 0.987 | 0.931 | 0.873 |
| 3.685088182660737 | 0.987 | 0.931 | 0.871 |
| 3.688229775314326 | 0.986 | 0.93 | 0.87 |
| 3.691371367967916 | 0.986 | 0.929 | 0.869 |
| 3.694512960621506 | 0.986 | 0.928 | 0.867 |
| 3.697654553275095 | 0.986 | 0.928 | 0.866 |
| 3.700796145928685 | 0.986 | 0.927 | 0.864 |
| 3.703937738582274 | 0.986 | 0.926 | 0.863 |
| 3.707079331235864 | 0.986 | 0.925 | 0.861 |
| 3.710220923889454 | 0.985 | 0.925 | 0.86 |
| 3.713362516543043 | 0.985 | 0.924 | 0.858 |
| 3.716504109196633 | 0.985 | 0.923 | 0.857 |
| 3.719645701850223 | 0.985 | 0.922 | 0.855 |
| 3.722787294503812 | 0.985 | 0.922 | 0.854 |
| 3.725928887157402 | 0.985 | 0.921 | 0.852 |
| 3.729070479810991 | 0.985 | 0.92 | 0.851 |
| 3.732212072464581 | 0.984 | 0.919 | 0.849 |
| 3.735353665118171 | 0.984 | 0.918 | 0.848 |
| 3.73849525777176 | 0.984 | 0.918 | 0.846 |
| 3.74163685042535 | 0.984 | 0.917 | 0.844 |
| 3.744778443078939 | 0.984 | 0.916 | 0.843 |
| 3.747920035732529 | 0.984 | 0.915 | 0.841 |
| 3.751061628386119 | 0.983 | 0.914 | 0.84 |
| 3.754203221039708 | 0.983 | 0.914 | 0.838 |
| 3.757344813693298 | 0.983 | 0.913 | 0.837 |
| 3.760486406346887 | 0.983 | 0.912 | 0.835 |
| 3.763627999000477 | 0.983 | 0.911 | 0.833 |
| 3.766769591654067 | 0.983 | 0.91 | 0.832 |
| 3.769911184307656 | 0.983 | 0.91 | 0.83 |
| 3.773052776961246 | 0.982 | 0.909 | 0.828 |
| 3.776194369614835 | 0.982 | 0.908 | 0.827 |
| 3.779335962268425 | 0.982 | 0.907 | 0.825 |
| 3.782477554922014 | 0.982 | 0.906 | 0.824 |
| 3.785619147575604 | 0.982 | 0.905 | 0.822 |
| 3.788760740229193 | 0.982 | 0.905 | 0.82 |
| 3.791902332882783 | 0.982 | 0.904 | 0.819 |
| 3.795043925536373 | 0.981 | 0.903 | 0.817 |
| 3.798185518189962 | 0.981 | 0.902 | 0.815 |
| 3.801327110843552 | 0.981 | 0.901 | 0.814 |
| 3.804468703497142 | 0.981 | 0.9 | 0.812 |
| 3.807610296150731 | 0.981 | 0.9 | 0.81 |
| 3.810751888804321 | 0.981 | 0.899 | 0.809 |
| 3.813893481457911 | 0.98 | 0.898 | 0.807 |
| 3.8170350741115 | 0.98 | 0.897 | 0.805 |
| 3.82017666676509 | 0.98 | 0.896 | 0.803 |
| 3.823318259418679 | 0.98 | 0.895 | 0.802 |
| 3.826459852072269 | 0.98 | 0.894 | 0.8 |
| 3.829601444725859 | 0.98 | 0.894 | 0.798 |
| 3.832743037379448 | 0.979 | 0.893 | 0.796 |
| 3.835884630033038 | 0.979 | 0.892 | 0.795 |
| 3.839026222686627 | 0.979 | 0.891 | 0.793 |
| 3.842167815340217 | 0.979 | 0.89 | 0.791 |
| 3.845309407993807 | 0.979 | 0.889 | 0.789 |
| 3.848451000647396 | 0.979 | 0.888 | 0.788 |
| 3.851592593300986 | 0.979 | 0.887 | 0.786 |
| 3.854734185954575 | 0.978 | 0.887 | 0.784 |
| 3.857875778608165 | 0.978 | 0.886 | 0.782 |
| 3.861017371261755 | 0.978 | 0.885 | 0.781 |
| 3.864158963915344 | 0.978 | 0.884 | 0.779 |
| 3.867300556568933 | 0.978 | 0.883 | 0.777 |
| 3.870442149222523 | 0.978 | 0.882 | 0.775 |
| 3.873583741876112 | 0.977 | 0.881 | 0.773 |
| 3.876725334529703 | 0.977 | 0.88 | 0.771 |
| 3.879866927183292 | 0.977 | 0.88 | 0.77 |
| 3.883008519836882 | 0.977 | 0.879 | 0.768 |
| 3.886150112490471 | 0.977 | 0.878 | 0.766 |
| 3.889291705144061 | 0.977 | 0.877 | 0.764 |
| 3.892433297797651 | 0.976 | 0.876 | 0.762 |
| 3.89557489045124 | 0.976 | 0.875 | 0.76 |
| 3.89871648310483 | 0.976 | 0.874 | 0.759 |
| 3.901858075758419 | 0.976 | 0.873 | 0.757 |
| 3.904999668412009 | 0.976 | 0.872 | 0.755 |
| 3.908141261065598 | 0.976 | 0.871 | 0.753 |
| 3.911282853719188 | 0.975 | 0.871 | 0.751 |
| 3.914424446372778 | 0.975 | 0.87 | 0.749 |
| 3.917566039026367 | 0.975 | 0.869 | 0.747 |
| 3.920707631679957 | 0.975 | 0.868 | 0.745 |
| 3.923849224333547 | 0.975 | 0.867 | 0.744 |
| 3.926990816987136 | 0.975 | 0.866 | 0.742 |
| 3.930132409640726 | 0.975 | 0.865 | 0.74 |
| 3.933274002294315 | 0.974 | 0.864 | 0.738 |
| 3.936415594947905 | 0.974 | 0.863 | 0.736 |
| 3.939557187601495 | 0.974 | 0.862 | 0.734 |
| 3.942698780255084 | 0.974 | 0.861 | 0.732 |
| 3.945840372908674 | 0.974 | 0.861 | 0.73 |
| 3.948981965562263 | 0.974 | 0.86 | 0.728 |
| 3.952123558215853 | 0.973 | 0.859 | 0.726 |
| 3.955265150869442 | 0.973 | 0.858 | 0.724 |
| 3.958406743523032 | 0.973 | 0.857 | 0.722 |
| 3.961548336176622 | 0.973 | 0.856 | 0.72 |
| 3.964689928830211 | 0.973 | 0.855 | 0.718 |
| 3.967831521483801 | 0.973 | 0.854 | 0.716 |
| 3.97097311413739 | 0.972 | 0.853 | 0.714 |
| 3.97411470679098 | 0.972 | 0.852 | 0.712 |
| 3.97725629944457 | 0.972 | 0.851 | 0.711 |
| 3.98039789209816 | 0.972 | 0.85 | 0.709 |
| 3.983539484751749 | 0.972 | 0.85 | 0.707 |
| 3.986681077405338 | 0.972 | 0.849 | 0.705 |
| 3.989822670058928 | 0.971 | 0.848 | 0.703 |
| 3.992964262712517 | 0.971 | 0.847 | 0.701 |
| 3.996105855366107 | 0.971 | 0.846 | 0.699 |
| 3.999247448019697 | 0.971 | 0.845 | 0.697 |
| 4.002389040673287 | 0.971 | 0.844 | 0.695 |
| 4.005530633326877 | 0.971 | 0.843 | 0.693 |
| 4.008672225980466 | 0.97 | 0.842 | 0.691 |
| 4.011813818634056 | 0.97 | 0.841 | 0.688 |
| 4.014955411287645 | 0.97 | 0.84 | 0.686 |
| 4.018097003941234 | 0.97 | 0.839 | 0.684 |
| 4.021238596594824 | 0.97 | 0.839 | 0.682 |
| 4.024380189248414 | 0.97 | 0.838 | 0.68 |
| 4.027521781902004 | 0.97 | 0.837 | 0.678 |
| 4.030663374555593 | 0.969 | 0.836 | 0.676 |
| 4.033804967209183 | 0.969 | 0.835 | 0.674 |
| 4.036946559862773 | 0.969 | 0.834 | 0.672 |
| 4.040088152516362 | 0.969 | 0.833 | 0.67 |
| 4.043229745169951 | 0.969 | 0.832 | 0.668 |
| 4.046371337823541 | 0.969 | 0.831 | 0.666 |
| 4.049512930477131 | 0.968 | 0.83 | 0.664 |
| 4.05265452313072 | 0.968 | 0.829 | 0.662 |
| 4.05579611578431 | 0.968 | 0.828 | 0.66 |
| 4.0589377084379 | 0.968 | 0.828 | 0.658 |
| 4.062079301091489 | 0.968 | 0.827 | 0.656 |
| 4.065220893745079 | 0.968 | 0.826 | 0.654 |
| 4.068362486398668 | 0.967 | 0.825 | 0.652 |
| 4.071504079052258 | 0.967 | 0.824 | 0.649 |
| 4.074645671705848 | 0.967 | 0.823 | 0.647 |
| 4.077787264359437 | 0.967 | 0.822 | 0.645 |
| 4.080928857013027 | 0.967 | 0.821 | 0.643 |
| 4.084070449666616 | 0.967 | 0.82 | 0.641 |
| 4.087212042320206 | 0.967 | 0.819 | 0.639 |
| 4.090353634973795 | 0.966 | 0.818 | 0.637 |
| 4.093495227627385 | 0.966 | 0.817 | 0.635 |
| 4.096636820280975 | 0.966 | 0.817 | 0.633 |
| 4.099778412934564 | 0.966 | 0.816 | 0.631 |
| 4.102920005588154 | 0.966 | 0.815 | 0.628 |
| 4.106061598241744 | 0.966 | 0.814 | 0.626 |
| 4.109203190895333 | 0.965 | 0.813 | 0.624 |
| 4.112344783548923 | 0.965 | 0.812 | 0.622 |
| 4.115486376202512 | 0.965 | 0.811 | 0.62 |
| 4.118627968856102 | 0.965 | 0.81 | 0.618 |
| 4.121769561509692 | 0.965 | 0.809 | 0.616 |
| 4.124911154163281 | 0.965 | 0.808 | 0.614 |
| 4.128052746816871 | 0.965 | 0.808 | 0.611 |
| 4.13119433947046 | 0.964 | 0.807 | 0.609 |
| 4.13433593212405 | 0.964 | 0.806 | 0.607 |
| 4.13747752477764 | 0.964 | 0.805 | 0.605 |
| 4.14061911743123 | 0.964 | 0.804 | 0.603 |
| 4.143760710084818 | 0.964 | 0.803 | 0.601 |
| 4.146902302738408 | 0.964 | 0.802 | 0.599 |
| 4.150043895391998 | 0.964 | 0.801 | 0.597 |
| 4.153185488045588 | 0.963 | 0.8 | 0.594 |
| 4.156327080699177 | 0.963 | 0.8 | 0.592 |
| 4.159468673352766 | 0.963 | 0.799 | 0.59 |
| 4.162610266006356 | 0.963 | 0.798 | 0.588 |
| 4.165751858659946 | 0.963 | 0.797 | 0.586 |
| 4.168893451313535 | 0.963 | 0.796 | 0.584 |
| 4.172035043967125 | 0.963 | 0.795 | 0.582 |
| 4.175176636620715 | 0.962 | 0.794 | 0.579 |
| 4.178318229274304 | 0.962 | 0.793 | 0.577 |
| 4.181459821927894 | 0.962 | 0.793 | 0.575 |
| 4.184601414581484 | 0.962 | 0.792 | 0.573 |
| 4.187743007235073 | 0.962 | 0.791 | 0.571 |
| 4.190884599888663 | 0.962 | 0.79 | 0.569 |
| 4.194026192542252 | 0.962 | 0.789 | 0.567 |
| 4.197167785195842 | 0.961 | 0.788 | 0.564 |
| 4.200309377849432 | 0.961 | 0.787 | 0.562 |
| 4.203450970503021 | 0.961 | 0.787 | 0.56 |
| 4.206592563156611 | 0.961 | 0.786 | 0.558 |
| 4.2097341558102 | 0.961 | 0.785 | 0.556 |
| 4.21287574846379 | 0.961 | 0.784 | 0.554 |
| 4.21601734111738 | 0.961 | 0.783 | 0.551 |
| 4.21915893377097 | 0.96 | 0.782 | 0.549 |
| 4.222300526424559 | 0.96 | 0.782 | 0.547 |
| 4.225442119078148 | 0.96 | 0.781 | 0.545 |
| 4.228583711731738 | 0.96 | 0.78 | 0.543 |
| 4.231725304385327 | 0.96 | 0.779 | 0.541 |
| 4.234866897038917 | 0.96 | 0.778 | 0.539 |
| 4.238008489692506 | 0.96 | 0.777 | 0.536 |
| 4.241150082346096 | 0.959 | 0.777 | 0.534 |
| 4.244291674999685 | 0.959 | 0.776 | 0.532 |
| 4.247433267653276 | 0.959 | 0.775 | 0.53 |
| 4.250574860306865 | 0.959 | 0.774 | 0.528 |
| 4.253716452960455 | 0.959 | 0.773 | 0.526 |
| 4.256858045614044 | 0.959 | 0.773 | 0.524 |
| 4.259999638267634 | 0.959 | 0.772 | 0.522 |
| 4.263141230921224 | 0.959 | 0.771 | 0.519 |
| 4.266282823574813 | 0.958 | 0.77 | 0.517 |
| 4.269424416228403 | 0.958 | 0.769 | 0.515 |
| 4.272566008881992 | 0.958 | 0.769 | 0.513 |
| 4.275707601535582 | 0.958 | 0.768 | 0.511 |
| 4.27884919418917 | 0.958 | 0.767 | 0.509 |
| 4.28199078684276 | 0.958 | 0.766 | 0.507 |
| 4.285132379496351 | 0.958 | 0.765 | 0.505 |
| 4.28827397214994 | 0.958 | 0.765 | 0.502 |
| 4.29141556480353 | 0.957 | 0.764 | 0.5 |
| 4.294557157457119 | 0.957 | 0.763 | 0.498 |
| 4.29769875011071 | 0.957 | 0.762 | 0.496 |
| 4.300840342764299 | 0.957 | 0.762 | 0.494 |
| 4.303981935417888 | 0.957 | 0.761 | 0.492 |
| 4.307123528071478 | 0.957 | 0.76 | 0.49 |
| 4.310265120725067 | 0.957 | 0.759 | 0.488 |
| 4.313406713378657 | 0.957 | 0.759 | 0.486 |
| 4.316548306032247 | 0.956 | 0.758 | 0.484 |
| 4.319689898685836 | 0.956 | 0.757 | 0.481 |
| 4.322831491339426 | 0.956 | 0.756 | 0.479 |
| 4.325973083993015 | 0.956 | 0.756 | 0.477 |
| 4.329114676646605 | 0.956 | 0.755 | 0.475 |
| 4.332256269300195 | 0.956 | 0.754 | 0.473 |
| 4.335397861953784 | 0.956 | 0.753 | 0.471 |
| 4.338539454607374 | 0.956 | 0.753 | 0.469 |
| 4.341681047260963 | 0.956 | 0.752 | 0.467 |
| 4.344822639914553 | 0.955 | 0.751 | 0.465 |
| 4.347964232568143 | 0.955 | 0.751 | 0.463 |
| 4.351105825221732 | 0.955 | 0.75 | 0.461 |
| 4.354247417875322 | 0.955 | 0.749 | 0.459 |
| 4.357389010528911 | 0.955 | 0.749 | 0.457 |
| 4.360530603182501 | 0.955 | 0.748 | 0.455 |
| 4.36367219583609 | 0.955 | 0.747 | 0.453 |
| 4.36681378848968 | 0.955 | 0.747 | 0.451 |
| 4.36995538114327 | 0.955 | 0.746 | 0.449 |
| 4.373096973796859 | 0.955 | 0.745 | 0.447 |
| 4.376238566450449 | 0.954 | 0.745 | 0.445 |
| 4.379380159104038 | 0.954 | 0.744 | 0.443 |
| 4.382521751757628 | 0.954 | 0.743 | 0.441 |
| 4.385663344411217 | 0.954 | 0.743 | 0.439 |
| 4.388804937064807 | 0.954 | 0.742 | 0.437 |
| 4.391946529718397 | 0.954 | 0.741 | 0.435 |
| 4.395088122371987 | 0.954 | 0.741 | 0.433 |
| 4.398229715025576 | 0.954 | 0.74 | 0.431 |
| 4.401371307679165 | 0.954 | 0.739 | 0.429 |
| 4.404512900332755 | 0.954 | 0.739 | 0.427 |
| 4.407654492986345 | 0.953 | 0.738 | 0.425 |
| 4.410796085639934 | 0.953 | 0.738 | 0.424 |
| 4.413937678293524 | 0.953 | 0.737 | 0.422 |
| 4.417079270947114 | 0.953 | 0.736 | 0.42 |
| 4.420220863600703 | 0.953 | 0.736 | 0.418 |
| 4.423362456254293 | 0.953 | 0.735 | 0.416 |
| 4.426504048907883 | 0.953 | 0.735 | 0.414 |
| 4.429645641561472 | 0.953 | 0.734 | 0.412 |
| 4.432787234215062 | 0.953 | 0.734 | 0.411 |
| 4.435928826868651 | 0.953 | 0.733 | 0.409 |
| 4.43907041952224 | 0.953 | 0.732 | 0.407 |
| 4.44221201217583 | 0.952 | 0.732 | 0.405 |
| 4.44535360482942 | 0.952 | 0.731 | 0.403 |
| 4.44849519748301 | 0.952 | 0.731 | 0.402 |
| 4.4516367901366 | 0.952 | 0.73 | 0.4 |
| 4.454778382790188 | 0.952 | 0.73 | 0.398 |
| 4.457919975443779 | 0.952 | 0.729 | 0.396 |
| 4.461061568097368 | 0.952 | 0.729 | 0.395 |
| 4.464203160750958 | 0.952 | 0.728 | 0.393 |
| 4.467344753404547 | 0.952 | 0.728 | 0.391 |
| 4.470486346058137 | 0.952 | 0.727 | 0.389 |
| 4.473627938711726 | 0.952 | 0.727 | 0.388 |
| 4.476769531365316 | 0.952 | 0.726 | 0.386 |
| 4.479911124018905 | 0.951 | 0.726 | 0.384 |
| 4.483052716672495 | 0.951 | 0.725 | 0.383 |
| 4.486194309326085 | 0.951 | 0.725 | 0.381 |
| 4.489335901979674 | 0.951 | 0.724 | 0.38 |
| 4.492477494633264 | 0.951 | 0.724 | 0.378 |
| 4.495619087286854 | 0.951 | 0.723 | 0.376 |
| 4.498760679940443 | 0.951 | 0.723 | 0.375 |
| 4.501902272594033 | 0.951 | 0.722 | 0.373 |
| 4.505043865247622 | 0.951 | 0.722 | 0.372 |
| 4.508185457901212 | 0.951 | 0.721 | 0.37 |
| 4.511327050554801 | 0.951 | 0.721 | 0.369 |
| 4.514468643208391 | 0.951 | 0.721 | 0.367 |
| 4.517610235861981 | 0.951 | 0.72 | 0.366 |
| 4.520751828515571 | 0.951 | 0.72 | 0.364 |
| 4.52389342116916 | 0.951 | 0.719 | 0.363 |
| 4.52703501382275 | 0.95 | 0.719 | 0.361 |
| 4.530176606476339 | 0.95 | 0.719 | 0.36 |
| 4.533318199129928 | 0.95 | 0.718 | 0.359 |
| 4.536459791783518 | 0.95 | 0.718 | 0.357 |
| 4.539601384437108 | 0.95 | 0.717 | 0.356 |
| 4.542742977090698 | 0.95 | 0.717 | 0.354 |
| 4.545884569744287 | 0.95 | 0.717 | 0.353 |
| 4.549026162397876 | 0.95 | 0.716 | 0.352 |
| 4.552167755051466 | 0.95 | 0.716 | 0.351 |
| 4.555309347705056 | 0.95 | 0.716 | 0.349 |
| 4.558450940358646 | 0.95 | 0.715 | 0.348 |
| 4.561592533012235 | 0.95 | 0.715 | 0.347 |
| 4.564734125665825 | 0.95 | 0.715 | 0.346 |
| 4.567875718319415 | 0.95 | 0.714 | 0.344 |
| 4.571017310973004 | 0.95 | 0.714 | 0.343 |
| 4.574158903626594 | 0.95 | 0.714 | 0.342 |
| 4.577300496280183 | 0.95 | 0.713 | 0.341 |
| 4.580442088933772 | 0.95 | 0.713 | 0.34 |
| 4.583583681587362 | 0.95 | 0.713 | 0.339 |
| 4.586725274240952 | 0.95 | 0.713 | 0.338 |
| 4.589866866894542 | 0.949 | 0.712 | 0.337 |
| 4.593008459548131 | 0.949 | 0.712 | 0.336 |
| 4.596150052201721 | 0.949 | 0.712 | 0.335 |
| 4.59929164485531 | 0.949 | 0.712 | 0.334 |
| 4.6024332375089 | 0.949 | 0.711 | 0.333 |
| 4.60557483016249 | 0.949 | 0.711 | 0.332 |
| 4.608716422816079 | 0.949 | 0.711 | 0.331 |
| 4.611858015469668 | 0.949 | 0.711 | 0.33 |
| 4.614999608123258 | 0.949 | 0.71 | 0.329 |
| 4.618141200776848 | 0.949 | 0.71 | 0.329 |
| 4.621282793430437 | 0.949 | 0.71 | 0.328 |
| 4.624424386084027 | 0.949 | 0.71 | 0.327 |
| 4.627565978737617 | 0.949 | 0.71 | 0.326 |
| 4.630707571391206 | 0.949 | 0.709 | 0.326 |
| 4.633849164044795 | 0.949 | 0.709 | 0.325 |
| 4.636990756698386 | 0.949 | 0.709 | 0.324 |
| 4.640132349351975 | 0.949 | 0.709 | 0.324 |
| 4.643273942005564 | 0.949 | 0.709 | 0.323 |
| 4.646415534659154 | 0.949 | 0.709 | 0.322 |
| 4.649557127312744 | 0.949 | 0.708 | 0.322 |
| 4.652698719966334 | 0.949 | 0.708 | 0.321 |
| 4.655840312619923 | 0.949 | 0.708 | 0.321 |
| 4.658981905273513 | 0.949 | 0.708 | 0.32 |
| 4.662123497927102 | 0.949 | 0.708 | 0.32 |
| 4.665265090580692 | 0.949 | 0.708 | 0.319 |
| 4.668406683234282 | 0.949 | 0.708 | 0.319 |
| 4.671548275887871 | 0.949 | 0.708 | 0.319 |
| 4.674689868541461 | 0.949 | 0.708 | 0.318 |
| 4.67783146119505 | 0.949 | 0.708 | 0.318 |
| 4.68097305384864 | 0.949 | 0.707 | 0.318 |
| 4.68411464650223 | 0.949 | 0.707 | 0.317 |
| 4.687256239155819 | 0.949 | 0.707 | 0.317 |
| 4.690397831809409 | 0.949 | 0.707 | 0.317 |
| 4.693539424462998 | 0.949 | 0.707 | 0.317 |
| 4.696681017116588 | 0.949 | 0.707 | 0.317 |
| 4.699822609770177 | 0.949 | 0.707 | 0.316 |
| 4.702964202423767 | 0.949 | 0.707 | 0.316 |
| 4.706105795077356 | 0.949 | 0.707 | 0.316 |
| 4.709247387730946 | 0.949 | 0.707 | 0.316 |
| 4.712388980384535 | 0.949 | 0.707 | 0.316 |
| 4.715530573038126 | 0.949 | 0.707 | 0.316 |
| 4.718672165691715 | 0.949 | 0.707 | 0.316 |
| 4.721813758345305 | 0.949 | 0.707 | 0.316 |
| 4.724955350998894 | 0.949 | 0.707 | 0.316 |
| 4.728096943652484 | 0.949 | 0.707 | 0.317 |
| 4.731238536306074 | 0.949 | 0.707 | 0.317 |
| 4.734380128959663 | 0.949 | 0.707 | 0.317 |
| 4.737521721613253 | 0.949 | 0.707 | 0.317 |
| 4.740663314266842 | 0.949 | 0.707 | 0.317 |
| 4.743804906920432 | 0.949 | 0.707 | 0.318 |
| 4.74694649957402 | 0.949 | 0.708 | 0.318 |
| 4.750088092227611 | 0.949 | 0.708 | 0.318 |
| 4.7532296848812 | 0.949 | 0.708 | 0.319 |
| 4.75637127753479 | 0.949 | 0.708 | 0.319 |
| 4.75951287018838 | 0.949 | 0.708 | 0.319 |
| 4.76265446284197 | 0.949 | 0.708 | 0.32 |
| 4.765796055495559 | 0.949 | 0.708 | 0.32 |
| 4.768937648149149 | 0.949 | 0.708 | 0.321 |
| 4.772079240802738 | 0.949 | 0.708 | 0.321 |
| 4.775220833456327 | 0.949 | 0.708 | 0.322 |
| 4.778362426109917 | 0.949 | 0.709 | 0.322 |
| 4.781504018763507 | 0.949 | 0.709 | 0.323 |
| 4.784645611417097 | 0.949 | 0.709 | 0.324 |
| 4.787787204070686 | 0.949 | 0.709 | 0.324 |
| 4.790928796724275 | 0.949 | 0.709 | 0.325 |
| 4.794070389377865 | 0.949 | 0.709 | 0.326 |
| 4.797211982031455 | 0.949 | 0.71 | 0.326 |
| 4.800353574685045 | 0.949 | 0.71 | 0.327 |
| 4.803495167338634 | 0.949 | 0.71 | 0.328 |
| 4.806636759992224 | 0.949 | 0.71 | 0.329 |
| 4.809778352645814 | 0.949 | 0.71 | 0.329 |
| 4.812919945299403 | 0.949 | 0.711 | 0.33 |
| 4.816061537952993 | 0.949 | 0.711 | 0.331 |
| 4.819203130606582 | 0.949 | 0.711 | 0.332 |
| 4.822344723260172 | 0.949 | 0.711 | 0.333 |
| 4.825486315913761 | 0.949 | 0.712 | 0.334 |
| 4.828627908567351 | 0.949 | 0.712 | 0.335 |
| 4.83176950122094 | 0.949 | 0.712 | 0.336 |
| 4.83491109387453 | 0.949 | 0.712 | 0.337 |
| 4.83805268652812 | 0.95 | 0.713 | 0.338 |
| 4.841194279181709 | 0.95 | 0.713 | 0.339 |
| 4.844335871835299 | 0.95 | 0.713 | 0.34 |
| 4.847477464488889 | 0.95 | 0.713 | 0.341 |
| 4.850619057142478 | 0.95 | 0.714 | 0.342 |
| 4.853760649796068 | 0.95 | 0.714 | 0.343 |
| 4.856902242449657 | 0.95 | 0.714 | 0.344 |
| 4.860043835103247 | 0.95 | 0.715 | 0.346 |
| 4.863185427756837 | 0.95 | 0.715 | 0.347 |
| 4.866327020410426 | 0.95 | 0.715 | 0.348 |
| 4.869468613064015 | 0.95 | 0.716 | 0.349 |
| 4.872610205717605 | 0.95 | 0.716 | 0.351 |
| 4.875751798371195 | 0.95 | 0.716 | 0.352 |
| 4.878893391024784 | 0.95 | 0.717 | 0.353 |
| 4.882034983678374 | 0.95 | 0.717 | 0.354 |
| 4.885176576331964 | 0.95 | 0.717 | 0.356 |
| 4.888318168985553 | 0.95 | 0.718 | 0.357 |
| 4.891459761639143 | 0.95 | 0.718 | 0.359 |
| 4.894601354292733 | 0.95 | 0.719 | 0.36 |
| 4.897742946946322 | 0.95 | 0.719 | 0.361 |
| 4.900884539599912 | 0.951 | 0.719 | 0.363 |
| 4.904026132253501 | 0.951 | 0.72 | 0.364 |
| 4.907167724907091 | 0.951 | 0.72 | 0.366 |
| 4.91030931756068 | 0.951 | 0.721 | 0.367 |
| 4.91345091021427 | 0.951 | 0.721 | 0.369 |
| 4.91659250286786 | 0.951 | 0.721 | 0.37 |
| 4.91973409552145 | 0.951 | 0.722 | 0.372 |
| 4.922875688175039 | 0.951 | 0.722 | 0.373 |
| 4.926017280828628 | 0.951 | 0.723 | 0.375 |
| 4.929158873482218 | 0.951 | 0.723 | 0.376 |
| 4.932300466135808 | 0.951 | 0.724 | 0.378 |
| 4.935442058789397 | 0.951 | 0.724 | 0.38 |
| 4.938583651442987 | 0.951 | 0.725 | 0.381 |
| 4.941725244096576 | 0.951 | 0.725 | 0.383 |
| 4.944866836750166 | 0.951 | 0.726 | 0.384 |
| 4.948008429403755 | 0.952 | 0.726 | 0.386 |
| 4.951150022057345 | 0.952 | 0.727 | 0.388 |
| 4.954291614710935 | 0.952 | 0.727 | 0.389 |
| 4.957433207364524 | 0.952 | 0.728 | 0.391 |
| 4.960574800018114 | 0.952 | 0.728 | 0.393 |
| 4.963716392671704 | 0.952 | 0.729 | 0.395 |
| 4.966857985325293 | 0.952 | 0.729 | 0.396 |
| 4.969999577978883 | 0.952 | 0.73 | 0.398 |
| 4.973141170632472 | 0.952 | 0.73 | 0.4 |
| 4.976282763286062 | 0.952 | 0.731 | 0.402 |
| 4.979424355939651 | 0.952 | 0.731 | 0.403 |
| 4.982565948593241 | 0.952 | 0.732 | 0.405 |
| 4.985707541246831 | 0.953 | 0.732 | 0.407 |
| 4.98884913390042 | 0.953 | 0.733 | 0.409 |
| 4.99199072655401 | 0.953 | 0.734 | 0.411 |
| 4.9951323192076 | 0.953 | 0.734 | 0.412 |
| 4.99827391186119 | 0.953 | 0.735 | 0.414 |
| 5.00141550451478 | 0.953 | 0.735 | 0.416 |
| 5.004557097168369 | 0.953 | 0.736 | 0.418 |
| 5.007698689821958 | 0.953 | 0.736 | 0.42 |
| 5.010840282475548 | 0.953 | 0.737 | 0.422 |
| 5.013981875129137 | 0.953 | 0.738 | 0.424 |
| 5.017123467782727 | 0.953 | 0.738 | 0.425 |
| 5.020265060436317 | 0.954 | 0.739 | 0.427 |
| 5.023406653089906 | 0.954 | 0.739 | 0.429 |
| 5.026548245743496 | 0.954 | 0.74 | 0.431 |
| 5.029689838397085 | 0.954 | 0.741 | 0.433 |
| 5.032831431050674 | 0.954 | 0.741 | 0.435 |
| 5.035973023704264 | 0.954 | 0.742 | 0.437 |
| 5.039114616357854 | 0.954 | 0.743 | 0.439 |
| 5.042256209011444 | 0.954 | 0.743 | 0.441 |
| 5.045397801665033 | 0.954 | 0.744 | 0.443 |
| 5.048539394318622 | 0.954 | 0.745 | 0.445 |
| 5.051680986972213 | 0.955 | 0.745 | 0.447 |
| 5.054822579625802 | 0.955 | 0.746 | 0.449 |
| 5.057964172279392 | 0.955 | 0.747 | 0.451 |
| 5.061105764932981 | 0.955 | 0.747 | 0.453 |
| 5.064247357586571 | 0.955 | 0.748 | 0.455 |
| 5.067388950240161 | 0.955 | 0.749 | 0.457 |
| 5.07053054289375 | 0.955 | 0.749 | 0.459 |
| 5.07367213554734 | 0.955 | 0.75 | 0.461 |
| 5.07681372820093 | 0.955 | 0.751 | 0.463 |
| 5.079955320854519 | 0.955 | 0.751 | 0.465 |
| 5.083096913508108 | 0.956 | 0.752 | 0.467 |
| 5.086238506161698 | 0.956 | 0.753 | 0.469 |
| 5.089380098815288 | 0.956 | 0.753 | 0.471 |
| 5.092521691468877 | 0.956 | 0.754 | 0.473 |
| 5.095663284122466 | 0.956 | 0.755 | 0.475 |
| 5.098804876776057 | 0.956 | 0.756 | 0.477 |
| 5.101946469429646 | 0.956 | 0.756 | 0.479 |
| 5.105088062083236 | 0.956 | 0.757 | 0.481 |
| 5.108229654736825 | 0.956 | 0.758 | 0.484 |
| 5.111371247390415 | 0.957 | 0.759 | 0.486 |
| 5.114512840044005 | 0.957 | 0.759 | 0.488 |
| 5.117654432697594 | 0.957 | 0.76 | 0.49 |
| 5.120796025351184 | 0.957 | 0.761 | 0.492 |
| 5.123937618004773 | 0.957 | 0.762 | 0.494 |
| 5.127079210658363 | 0.957 | 0.762 | 0.496 |
| 5.130220803311953 | 0.957 | 0.763 | 0.498 |
| 5.133362395965542 | 0.957 | 0.764 | 0.5 |
| 5.136503988619131 | 0.958 | 0.765 | 0.502 |
| 5.13964558127272 | 0.958 | 0.765 | 0.505 |
| 5.142787173926311 | 0.958 | 0.766 | 0.507 |
| 5.1459287665799 | 0.958 | 0.767 | 0.509 |
| 5.14907035923349 | 0.958 | 0.768 | 0.511 |
| 5.15221195188708 | 0.958 | 0.769 | 0.513 |
| 5.15535354454067 | 0.958 | 0.769 | 0.515 |
| 5.158495137194259 | 0.958 | 0.77 | 0.517 |
| 5.161636729847848 | 0.959 | 0.771 | 0.519 |
| 5.164778322501438 | 0.959 | 0.772 | 0.522 |
| 5.167919915155028 | 0.959 | 0.773 | 0.524 |
| 5.171061507808617 | 0.959 | 0.773 | 0.526 |
| 5.174203100462206 | 0.959 | 0.774 | 0.528 |
| 5.177344693115796 | 0.959 | 0.775 | 0.53 |
| 5.180486285769386 | 0.959 | 0.776 | 0.532 |
| 5.183627878422976 | 0.959 | 0.777 | 0.534 |
| 5.186769471076565 | 0.96 | 0.777 | 0.536 |
| 5.189911063730155 | 0.96 | 0.778 | 0.539 |
| 5.193052656383744 | 0.96 | 0.779 | 0.541 |
| 5.196194249037334 | 0.96 | 0.78 | 0.543 |
| 5.199335841690924 | 0.96 | 0.781 | 0.545 |
| 5.202477434344513 | 0.96 | 0.782 | 0.547 |
| 5.205619026998103 | 0.96 | 0.782 | 0.549 |
| 5.208760619651692 | 0.961 | 0.783 | 0.551 |
| 5.211902212305282 | 0.961 | 0.784 | 0.554 |
| 5.215043804958871 | 0.961 | 0.785 | 0.556 |
| 5.218185397612461 | 0.961 | 0.786 | 0.558 |
| 5.221326990266051 | 0.961 | 0.787 | 0.56 |
| 5.22446858291964 | 0.961 | 0.787 | 0.562 |
| 5.22761017557323 | 0.961 | 0.788 | 0.564 |
| 5.23075176822682 | 0.962 | 0.789 | 0.567 |
| 5.23389336088041 | 0.962 | 0.79 | 0.569 |
| 5.237034953533999 | 0.962 | 0.791 | 0.571 |
| 5.240176546187588 | 0.962 | 0.792 | 0.573 |
| 5.243318138841178 | 0.962 | 0.793 | 0.575 |
| 5.246459731494767 | 0.962 | 0.793 | 0.577 |
| 5.249601324148357 | 0.962 | 0.794 | 0.579 |
| 5.252742916801947 | 0.963 | 0.795 | 0.582 |
| 5.255884509455536 | 0.963 | 0.796 | 0.584 |
| 5.259026102109125 | 0.963 | 0.797 | 0.586 |
| 5.262167694762715 | 0.963 | 0.798 | 0.588 |
| 5.265309287416305 | 0.963 | 0.799 | 0.59 |
| 5.268450880069895 | 0.963 | 0.8 | 0.592 |
| 5.271592472723484 | 0.963 | 0.8 | 0.594 |
| 5.274734065377074 | 0.964 | 0.801 | 0.597 |
| 5.277875658030664 | 0.964 | 0.802 | 0.599 |
| 5.281017250684253 | 0.964 | 0.803 | 0.601 |
| 5.284158843337843 | 0.964 | 0.804 | 0.603 |
| 5.287300435991432 | 0.964 | 0.805 | 0.605 |
| 5.290442028645022 | 0.964 | 0.806 | 0.607 |
| 5.293583621298612 | 0.964 | 0.807 | 0.609 |
| 5.296725213952201 | 0.965 | 0.808 | 0.611 |
| 5.299866806605791 | 0.965 | 0.808 | 0.614 |
| 5.30300839925938 | 0.965 | 0.809 | 0.616 |
| 5.30614999191297 | 0.965 | 0.81 | 0.618 |
| 5.30929158456656 | 0.965 | 0.811 | 0.62 |
| 5.312433177220149 | 0.965 | 0.812 | 0.622 |
| 5.315574769873739 | 0.965 | 0.813 | 0.624 |
| 5.318716362527328 | 0.966 | 0.814 | 0.626 |
| 5.321857955180918 | 0.966 | 0.815 | 0.628 |
| 5.324999547834508 | 0.966 | 0.816 | 0.631 |
| 5.328141140488097 | 0.966 | 0.817 | 0.633 |
| 5.331282733141686 | 0.966 | 0.817 | 0.635 |
| 5.334424325795276 | 0.966 | 0.818 | 0.637 |
| 5.337565918448866 | 0.967 | 0.819 | 0.639 |
| 5.340707511102456 | 0.967 | 0.82 | 0.641 |
| 5.343849103756045 | 0.967 | 0.821 | 0.643 |
| 5.346990696409634 | 0.967 | 0.822 | 0.645 |
| 5.350132289063224 | 0.967 | 0.823 | 0.647 |
| 5.353273881716814 | 0.967 | 0.824 | 0.649 |
| 5.356415474370403 | 0.967 | 0.825 | 0.652 |
| 5.359557067023993 | 0.968 | 0.826 | 0.654 |
| 5.362698659677583 | 0.968 | 0.827 | 0.656 |
| 5.365840252331172 | 0.968 | 0.828 | 0.658 |
| 5.368981844984762 | 0.968 | 0.828 | 0.66 |
| 5.372123437638351 | 0.968 | 0.829 | 0.662 |
| 5.375265030291941 | 0.968 | 0.83 | 0.664 |
| 5.378406622945531 | 0.969 | 0.831 | 0.666 |
| 5.38154821559912 | 0.969 | 0.832 | 0.668 |
| 5.38468980825271 | 0.969 | 0.833 | 0.67 |
| 5.387831400906299 | 0.969 | 0.834 | 0.672 |
| 5.39097299355989 | 0.969 | 0.835 | 0.674 |
| 5.394114586213479 | 0.969 | 0.836 | 0.676 |
| 5.397256178867068 | 0.97 | 0.837 | 0.678 |
| 5.400397771520657 | 0.97 | 0.838 | 0.68 |
| 5.403539364174247 | 0.97 | 0.839 | 0.682 |
| 5.406680956827837 | 0.97 | 0.839 | 0.684 |
| 5.409822549481426 | 0.97 | 0.84 | 0.686 |
| 5.412964142135016 | 0.97 | 0.841 | 0.688 |
| 5.416105734788605 | 0.97 | 0.842 | 0.691 |
| 5.419247327442195 | 0.971 | 0.843 | 0.693 |
| 5.422388920095785 | 0.971 | 0.844 | 0.695 |
| 5.425530512749375 | 0.971 | 0.845 | 0.697 |
| 5.428672105402964 | 0.971 | 0.846 | 0.699 |
| 5.431813698056554 | 0.971 | 0.847 | 0.701 |
| 5.434955290710143 | 0.971 | 0.848 | 0.703 |
| 5.438096883363733 | 0.972 | 0.849 | 0.705 |
| 5.441238476017322 | 0.972 | 0.85 | 0.707 |
| 5.444380068670912 | 0.972 | 0.85 | 0.709 |
| 5.447521661324502 | 0.972 | 0.851 | 0.711 |
| 5.450663253978091 | 0.972 | 0.852 | 0.712 |
| 5.453804846631681 | 0.972 | 0.853 | 0.714 |
| 5.456946439285271 | 0.973 | 0.854 | 0.716 |
| 5.46008803193886 | 0.973 | 0.855 | 0.718 |
| 5.46322962459245 | 0.973 | 0.856 | 0.72 |
| 5.466371217246039 | 0.973 | 0.857 | 0.722 |
| 5.46951280989963 | 0.973 | 0.858 | 0.724 |
| 5.472654402553218 | 0.973 | 0.859 | 0.726 |
| 5.475795995206808 | 0.974 | 0.86 | 0.728 |
| 5.478937587860398 | 0.974 | 0.861 | 0.73 |
| 5.482079180513987 | 0.974 | 0.861 | 0.732 |
| 5.485220773167577 | 0.974 | 0.862 | 0.734 |
| 5.488362365821166 | 0.974 | 0.863 | 0.736 |
| 5.491503958474756 | 0.974 | 0.864 | 0.738 |
| 5.494645551128346 | 0.975 | 0.865 | 0.74 |
| 5.497787143781935 | 0.975 | 0.866 | 0.742 |
| 5.500928736435525 | 0.975 | 0.867 | 0.744 |
| 5.504070329089115 | 0.975 | 0.868 | 0.745 |
| 5.507211921742704 | 0.975 | 0.869 | 0.747 |
| 5.510353514396294 | 0.975 | 0.87 | 0.749 |
| 5.513495107049883 | 0.975 | 0.871 | 0.751 |
| 5.516636699703473 | 0.976 | 0.871 | 0.753 |
| 5.519778292357062 | 0.976 | 0.872 | 0.755 |
| 5.522919885010652 | 0.976 | 0.873 | 0.757 |
| 5.526061477664242 | 0.976 | 0.874 | 0.759 |
| 5.529203070317831 | 0.976 | 0.875 | 0.76 |
| 5.532344662971421 | 0.976 | 0.876 | 0.762 |
| 5.535486255625011 | 0.977 | 0.877 | 0.764 |
| 5.5386278482786 | 0.977 | 0.878 | 0.766 |
| 5.54176944093219 | 0.977 | 0.879 | 0.768 |
| 5.544911033585779 | 0.977 | 0.88 | 0.77 |
| 5.54805262623937 | 0.977 | 0.88 | 0.771 |
| 5.551194218892959 | 0.977 | 0.881 | 0.773 |
| 5.554335811546548 | 0.978 | 0.882 | 0.775 |
| 5.557477404200137 | 0.978 | 0.883 | 0.777 |
| 5.560618996853727 | 0.978 | 0.884 | 0.779 |
| 5.563760589507317 | 0.978 | 0.885 | 0.781 |
| 5.566902182160906 | 0.978 | 0.886 | 0.782 |
| 5.570043774814496 | 0.978 | 0.887 | 0.784 |
| 5.573185367468086 | 0.979 | 0.887 | 0.786 |
| 5.576326960121675 | 0.979 | 0.888 | 0.788 |
| 5.579468552775264 | 0.979 | 0.889 | 0.789 |
| 5.582610145428854 | 0.979 | 0.89 | 0.791 |
| 5.585751738082444 | 0.979 | 0.891 | 0.793 |
| 5.588893330736034 | 0.979 | 0.892 | 0.795 |
| 5.592034923389623 | 0.979 | 0.893 | 0.796 |
| 5.595176516043213 | 0.98 | 0.894 | 0.798 |
| 5.598318108696803 | 0.98 | 0.894 | 0.8 |
| 5.601459701350392 | 0.98 | 0.895 | 0.802 |
| 5.604601294003982 | 0.98 | 0.896 | 0.803 |
| 5.607742886657571 | 0.98 | 0.897 | 0.805 |
| 5.610884479311161 | 0.98 | 0.898 | 0.807 |
| 5.61402607196475 | 0.981 | 0.899 | 0.809 |
| 5.61716766461834 | 0.981 | 0.9 | 0.81 |
| 5.62030925727193 | 0.981 | 0.9 | 0.812 |
| 5.623450849925519 | 0.981 | 0.901 | 0.814 |
| 5.626592442579109 | 0.981 | 0.902 | 0.815 |
| 5.629734035232698 | 0.981 | 0.903 | 0.817 |
| 5.632875627886288 | 0.982 | 0.904 | 0.819 |
| 5.636017220539878 | 0.982 | 0.905 | 0.82 |
| 5.639158813193467 | 0.982 | 0.905 | 0.822 |
| 5.642300405847057 | 0.982 | 0.906 | 0.824 |
| 5.645441998500646 | 0.982 | 0.907 | 0.825 |
| 5.648583591154236 | 0.982 | 0.908 | 0.827 |
| 5.651725183807825 | 0.982 | 0.909 | 0.828 |
| 5.654866776461415 | 0.983 | 0.91 | 0.83 |
| 5.658008369115005 | 0.983 | 0.91 | 0.832 |
| 5.661149961768594 | 0.983 | 0.911 | 0.833 |
| 5.664291554422184 | 0.983 | 0.912 | 0.835 |
| 5.667433147075774 | 0.983 | 0.913 | 0.837 |
| 5.670574739729363 | 0.983 | 0.914 | 0.838 |
| 5.673716332382953 | 0.983 | 0.914 | 0.84 |
| 5.676857925036542 | 0.984 | 0.915 | 0.841 |
| 5.679999517690132 | 0.984 | 0.916 | 0.843 |
| 5.683141110343721 | 0.984 | 0.917 | 0.844 |
| 5.686282702997311 | 0.984 | 0.918 | 0.846 |
| 5.689424295650901 | 0.984 | 0.918 | 0.848 |
| 5.69256588830449 | 0.984 | 0.919 | 0.849 |
| 5.69570748095808 | 0.985 | 0.92 | 0.851 |
| 5.69884907361167 | 0.985 | 0.921 | 0.852 |
| 5.701990666265259 | 0.985 | 0.922 | 0.854 |
| 5.705132258918849 | 0.985 | 0.922 | 0.855 |
| 5.708273851572438 | 0.985 | 0.923 | 0.857 |
| 5.711415444226028 | 0.985 | 0.924 | 0.858 |
| 5.714557036879618 | 0.985 | 0.925 | 0.86 |
| 5.717698629533207 | 0.986 | 0.925 | 0.861 |
| 5.720840222186797 | 0.986 | 0.926 | 0.863 |
| 5.723981814840386 | 0.986 | 0.927 | 0.864 |
| 5.727123407493976 | 0.986 | 0.928 | 0.866 |
| 5.730265000147565 | 0.986 | 0.928 | 0.867 |
| 5.733406592801155 | 0.986 | 0.929 | 0.869 |
| 5.736548185454744 | 0.986 | 0.93 | 0.87 |
| 5.739689778108334 | 0.987 | 0.931 | 0.871 |
| 5.742831370761924 | 0.987 | 0.931 | 0.873 |
| 5.745972963415514 | 0.987 | 0.932 | 0.874 |
| 5.749114556069103 | 0.987 | 0.933 | 0.876 |
| 5.752256148722693 | 0.987 | 0.934 | 0.877 |
| 5.755397741376282 | 0.987 | 0.934 | 0.878 |
| 5.758539334029872 | 0.987 | 0.935 | 0.88 |
| 5.761680926683462 | 0.988 | 0.936 | 0.881 |
| 5.764822519337051 | 0.988 | 0.937 | 0.883 |
| 5.767964111990641 | 0.988 | 0.937 | 0.884 |
| 5.77110570464423 | 0.988 | 0.938 | 0.885 |
| 5.77424729729782 | 0.988 | 0.939 | 0.887 |
| 5.77738888995141 | 0.988 | 0.939 | 0.888 |
| 5.780530482605 | 0.988 | 0.94 | 0.889 |
| 5.783672075258588 | 0.988 | 0.941 | 0.891 |
| 5.786813667912178 | 0.989 | 0.942 | 0.892 |
| 5.789955260565768 | 0.989 | 0.942 | 0.893 |
| 5.793096853219358 | 0.989 | 0.943 | 0.895 |
| 5.796238445872947 | 0.989 | 0.944 | 0.896 |
| 5.799380038526537 | 0.989 | 0.944 | 0.897 |
| 5.802521631180126 | 0.989 | 0.945 | 0.899 |
| 5.805663223833715 | 0.989 | 0.946 | 0.9 |
| 5.808804816487306 | 0.99 | 0.946 | 0.901 |
| 5.811946409140895 | 0.99 | 0.947 | 0.902 |
| 5.815088001794485 | 0.99 | 0.948 | 0.904 |
| 5.818229594448074 | 0.99 | 0.948 | 0.905 |
| 5.821371187101663 | 0.99 | 0.949 | 0.906 |
| 5.824512779755254 | 0.99 | 0.95 | 0.908 |
| 5.827654372408843 | 0.99 | 0.95 | 0.909 |
| 5.830795965062433 | 0.99 | 0.951 | 0.91 |
| 5.833937557716022 | 0.991 | 0.952 | 0.911 |
| 5.837079150369612 | 0.991 | 0.952 | 0.912 |
| 5.840220743023201 | 0.991 | 0.953 | 0.914 |
| 5.843362335676791 | 0.991 | 0.954 | 0.915 |
| 5.846503928330381 | 0.991 | 0.954 | 0.916 |
| 5.84964552098397 | 0.991 | 0.955 | 0.917 |
| 5.85278711363756 | 0.991 | 0.955 | 0.918 |
| 5.85592870629115 | 0.991 | 0.956 | 0.919 |
| 5.85907029894474 | 0.991 | 0.957 | 0.921 |
| 5.862211891598329 | 0.992 | 0.957 | 0.922 |
| 5.865353484251918 | 0.992 | 0.958 | 0.923 |
| 5.868495076905508 | 0.992 | 0.959 | 0.924 |
| 5.871636669559098 | 0.992 | 0.959 | 0.925 |
| 5.874778262212687 | 0.992 | 0.96 | 0.926 |
| 5.877919854866277 | 0.992 | 0.96 | 0.927 |
| 5.881061447519866 | 0.992 | 0.961 | 0.929 |
| 5.884203040173456 | 0.992 | 0.962 | 0.93 |
| 5.887344632827046 | 0.993 | 0.962 | 0.931 |
| 5.890486225480635 | 0.993 | 0.963 | 0.932 |
| 5.893627818134224 | 0.993 | 0.963 | 0.933 |
| 5.896769410787814 | 0.993 | 0.964 | 0.934 |
| 5.899911003441404 | 0.993 | 0.964 | 0.935 |
| 5.903052596094994 | 0.993 | 0.965 | 0.936 |
| 5.906194188748583 | 0.993 | 0.966 | 0.937 |
| 5.909335781402172 | 0.993 | 0.966 | 0.938 |
| 5.912477374055762 | 0.993 | 0.967 | 0.939 |
| 5.915618966709352 | 0.994 | 0.967 | 0.94 |
| 5.918760559362942 | 0.994 | 0.968 | 0.941 |
| 5.921902152016531 | 0.994 | 0.968 | 0.942 |
| 5.92504374467012 | 0.994 | 0.969 | 0.943 |
| 5.92818533732371 | 0.994 | 0.969 | 0.944 |
| 5.9313269299773 | 0.994 | 0.97 | 0.945 |
| 5.93446852263089 | 0.994 | 0.97 | 0.946 |
| 5.93761011528448 | 0.994 | 0.971 | 0.947 |
| 5.940751707938068 | 0.994 | 0.971 | 0.948 |
| 5.943893300591658 | 0.994 | 0.972 | 0.949 |
| 5.947034893245248 | 0.995 | 0.972 | 0.95 |
| 5.950176485898837 | 0.995 | 0.973 | 0.951 |
| 5.953318078552427 | 0.995 | 0.973 | 0.952 |
| 5.956459671206017 | 0.995 | 0.974 | 0.953 |
| 5.959601263859606 | 0.995 | 0.974 | 0.953 |
| 5.962742856513196 | 0.995 | 0.975 | 0.954 |
| 5.965884449166785 | 0.995 | 0.975 | 0.955 |
| 5.969026041820375 | 0.995 | 0.976 | 0.956 |
| 5.972167634473964 | 0.995 | 0.976 | 0.957 |
| 5.975309227127554 | 0.995 | 0.977 | 0.958 |
| 5.978450819781144 | 0.995 | 0.977 | 0.959 |
| 5.981592412434733 | 0.996 | 0.978 | 0.959 |
| 5.984734005088323 | 0.996 | 0.978 | 0.96 |
| 5.987875597741913 | 0.996 | 0.979 | 0.961 |
| 5.991017190395502 | 0.996 | 0.979 | 0.962 |
| 5.994158783049092 | 0.996 | 0.979 | 0.963 |
| 5.997300375702681 | 0.996 | 0.98 | 0.964 |
| 6.000441968356271 | 0.996 | 0.98 | 0.964 |
| 6.003583561009861 | 0.996 | 0.981 | 0.965 |
| 6.00672515366345 | 0.996 | 0.981 | 0.966 |
| 6.00986674631704 | 0.996 | 0.982 | 0.967 |
| 6.01300833897063 | 0.996 | 0.982 | 0.967 |
| 6.01614993162422 | 0.997 | 0.982 | 0.968 |
| 6.019291524277808 | 0.997 | 0.983 | 0.969 |
| 6.022433116931398 | 0.997 | 0.983 | 0.97 |
| 6.025574709584988 | 0.997 | 0.984 | 0.97 |
| 6.028716302238577 | 0.997 | 0.984 | 0.971 |
| 6.031857894892167 | 0.997 | 0.984 | 0.972 |
| 6.034999487545757 | 0.997 | 0.985 | 0.972 |
| 6.038141080199346 | 0.997 | 0.985 | 0.973 |
| 6.041282672852935 | 0.997 | 0.986 | 0.974 |
| 6.044424265506525 | 0.997 | 0.986 | 0.975 |
| 6.047565858160115 | 0.997 | 0.986 | 0.975 |
| 6.050707450813704 | 0.997 | 0.987 | 0.976 |
| 6.053849043467294 | 0.997 | 0.987 | 0.976 |
| 6.056990636120884 | 0.997 | 0.987 | 0.977 |
| 6.060132228774473 | 0.998 | 0.988 | 0.978 |
| 6.063273821428063 | 0.998 | 0.988 | 0.978 |
| 6.066415414081653 | 0.998 | 0.988 | 0.979 |
| 6.069557006735242 | 0.998 | 0.989 | 0.98 |
| 6.072698599388831 | 0.998 | 0.989 | 0.98 |
| 6.07584019204242 | 0.998 | 0.989 | 0.981 |
| 6.078981784696011 | 0.998 | 0.99 | 0.981 |
| 6.082123377349601 | 0.998 | 0.99 | 0.982 |
| 6.08526497000319 | 0.998 | 0.99 | 0.982 |
| 6.08840656265678 | 0.998 | 0.991 | 0.983 |
| 6.09154815531037 | 0.998 | 0.991 | 0.984 |
| 6.094689747963959 | 0.998 | 0.991 | 0.984 |
| 6.097831340617549 | 0.998 | 0.991 | 0.985 |
| 6.100972933271138 | 0.998 | 0.992 | 0.985 |
| 6.104114525924728 | 0.998 | 0.992 | 0.986 |
| 6.107256118578317 | 0.998 | 0.992 | 0.986 |
| 6.110397711231907 | 0.999 | 0.993 | 0.987 |
| 6.113539303885497 | 0.999 | 0.993 | 0.987 |
| 6.116680896539086 | 0.999 | 0.993 | 0.988 |
| 6.119822489192675 | 0.999 | 0.993 | 0.988 |
| 6.122964081846265 | 0.999 | 0.994 | 0.988 |
| 6.126105674499855 | 0.999 | 0.994 | 0.989 |
| 6.129247267153445 | 0.999 | 0.994 | 0.989 |
| 6.132388859807034 | 0.999 | 0.994 | 0.99 |
| 6.135530452460624 | 0.999 | 0.995 | 0.99 |
| 6.138672045114213 | 0.999 | 0.995 | 0.991 |
| 6.141813637767803 | 0.999 | 0.995 | 0.991 |
| 6.144955230421393 | 0.999 | 0.995 | 0.991 |
| 6.148096823074982 | 0.999 | 0.995 | 0.992 |
| 6.151238415728571 | 0.999 | 0.996 | 0.992 |
| 6.154380008382161 | 0.999 | 0.996 | 0.993 |
| 6.157521601035751 | 0.999 | 0.996 | 0.993 |
| 6.16066319368934 | 0.999 | 0.996 | 0.993 |
| 6.16380478634293 | 0.999 | 0.996 | 0.994 |
| 6.16694637899652 | 0.999 | 0.997 | 0.994 |
| 6.170087971650109 | 0.999 | 0.997 | 0.994 |
| 6.173229564303698 | 0.999 | 0.997 | 0.995 |
| 6.176371156957289 | 0.999 | 0.997 | 0.995 |
| 6.179512749610878 | 0.999 | 0.997 | 0.995 |
| 6.182654342264468 | 0.999 | 0.997 | 0.995 |
| 6.185795934918057 | 1 | 0.998 | 0.996 |
| 6.188937527571647 | 1 | 0.998 | 0.996 |
| 6.192079120225237 | 1 | 0.998 | 0.996 |
| 6.195220712878826 | 1 | 0.998 | 0.997 |
| 6.198362305532415 | 1 | 0.998 | 0.997 |
| 6.201503898186005 | 1 | 0.998 | 0.997 |
| 6.204645490839594 | 1 | 0.998 | 0.997 |
| 6.207787083493184 | 1 | 0.999 | 0.997 |
| 6.210928676146774 | 1 | 0.999 | 0.998 |
| 6.214070268800364 | 1 | 0.999 | 0.998 |
| 6.217211861453953 | 1 | 0.999 | 0.998 |
| 6.220353454107543 | 1 | 0.999 | 0.998 |
| 6.223495046761133 | 1 | 0.999 | 0.998 |
| 6.226636639414722 | 1 | 0.999 | 0.999 |
| 6.229778232068312 | 1 | 0.999 | 0.999 |
| 6.232919824721901 | 1 | 0.999 | 0.999 |
| 6.236061417375491 | 1 | 0.999 | 0.999 |
| 6.23920301002908 | 1 | 1 | 0.999 |
| 6.24234460268267 | 1 | 1 | 0.999 |
| 6.24548619533626 | 1 | 1 | 0.999 |
| 6.24862778798985 | 1 | 1 | 0.999 |
| 6.251769380643438 | 1 | 1 | 1 |
| 6.254910973297028 | 1 | 1 | 1 |
| 6.258052565950618 | 1 | 1 | 1 |
| 6.261194158604208 | 1 | 1 | 1 |
| 6.264335751257797 | 1 | 1 | 1 |
| 6.267477343911387 | 1 | 1 | 1 |
| 6.270618936564976 | 1 | 1 | 1 |
| 6.273760529218566 | 1 | 1 | 1 |
| 6.276902121872155 | 1 | 1 | 1 |
| 6.280043714525745 | 1 | 1 | 1 |
| 6.283185307179335 | 1 | 1 | 1 |